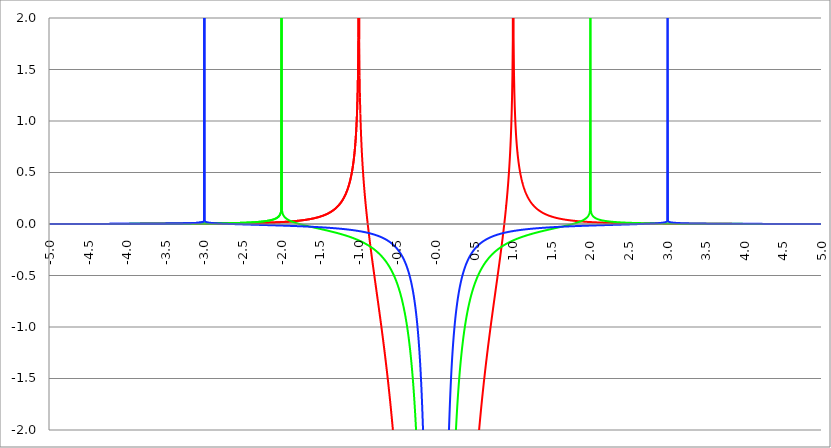
| Category | Series 1 | Series 0 | Series 2 |
|---|---|---|---|
| -5.0 | 0 | 0 | 0.001 |
| -4.995 | 0 | 0 | 0.001 |
| -4.99 | 0 | 0 | 0.001 |
| -4.985 | 0 | 0 | 0.001 |
| -4.98 | 0 | 0 | 0.001 |
| -4.975 | 0 | 0 | 0.001 |
| -4.97 | 0 | 0 | 0.001 |
| -4.965000000000001 | 0 | 0 | 0.001 |
| -4.960000000000001 | 0 | 0 | 0.001 |
| -4.955000000000001 | 0 | 0 | 0.001 |
| -4.950000000000001 | 0 | 0 | 0.001 |
| -4.945000000000001 | 0 | 0 | 0.001 |
| -4.940000000000001 | 0 | 0 | 0.001 |
| -4.935000000000001 | 0 | 0 | 0.001 |
| -4.930000000000001 | 0 | 0 | 0.001 |
| -4.925000000000002 | 0 | 0 | 0.001 |
| -4.920000000000002 | 0 | 0 | 0.001 |
| -4.915000000000002 | 0 | 0 | 0.001 |
| -4.910000000000002 | 0 | 0 | 0.001 |
| -4.905000000000002 | 0 | 0 | 0.001 |
| -4.900000000000002 | 0 | 0 | 0.001 |
| -4.895000000000002 | 0 | 0 | 0.001 |
| -4.890000000000002 | 0 | 0 | 0.001 |
| -4.885000000000002 | 0 | 0 | 0.001 |
| -4.880000000000002 | 0 | 0 | 0.001 |
| -4.875000000000003 | 0 | 0 | 0.001 |
| -4.870000000000003 | 0 | 0.001 | 0.001 |
| -4.865000000000003 | 0 | 0.001 | 0.001 |
| -4.860000000000003 | 0 | 0.001 | 0.001 |
| -4.855000000000003 | 0 | 0.001 | 0.001 |
| -4.850000000000003 | 0 | 0.001 | 0.001 |
| -4.845000000000003 | 0 | 0.001 | 0.001 |
| -4.840000000000003 | 0 | 0.001 | 0.001 |
| -4.835000000000003 | 0 | 0.001 | 0.001 |
| -4.830000000000004 | 0 | 0.001 | 0.001 |
| -4.825000000000004 | 0 | 0.001 | 0.001 |
| -4.820000000000004 | 0 | 0.001 | 0.001 |
| -4.815000000000004 | 0 | 0.001 | 0.001 |
| -4.810000000000004 | 0 | 0.001 | 0.001 |
| -4.805000000000004 | 0 | 0.001 | 0.001 |
| -4.800000000000004 | 0 | 0.001 | 0.001 |
| -4.795000000000004 | 0 | 0.001 | 0.001 |
| -4.790000000000004 | 0 | 0.001 | 0.001 |
| -4.785000000000004 | 0 | 0.001 | 0.001 |
| -4.780000000000004 | 0 | 0.001 | 0.001 |
| -4.775000000000004 | 0 | 0.001 | 0.001 |
| -4.770000000000004 | 0 | 0.001 | 0.001 |
| -4.765000000000005 | 0 | 0.001 | 0.001 |
| -4.760000000000005 | 0.001 | 0.001 | 0.001 |
| -4.755000000000005 | 0.001 | 0.001 | 0.001 |
| -4.750000000000005 | 0.001 | 0.001 | 0.001 |
| -4.745000000000005 | 0.001 | 0.001 | 0.001 |
| -4.740000000000005 | 0.001 | 0.001 | 0.001 |
| -4.735000000000005 | 0.001 | 0.001 | 0.001 |
| -4.730000000000005 | 0.001 | 0.001 | 0.001 |
| -4.725000000000006 | 0.001 | 0.001 | 0.001 |
| -4.720000000000006 | 0.001 | 0.001 | 0.001 |
| -4.715000000000006 | 0.001 | 0.001 | 0.001 |
| -4.710000000000006 | 0.001 | 0.001 | 0.001 |
| -4.705000000000006 | 0.001 | 0.001 | 0.001 |
| -4.700000000000006 | 0.001 | 0.001 | 0.001 |
| -4.695000000000006 | 0.001 | 0.001 | 0.001 |
| -4.690000000000006 | 0.001 | 0.001 | 0.001 |
| -4.685000000000007 | 0.001 | 0.001 | 0.001 |
| -4.680000000000007 | 0.001 | 0.001 | 0.001 |
| -4.675000000000007 | 0.001 | 0.001 | 0.001 |
| -4.670000000000007 | 0.001 | 0.001 | 0.001 |
| -4.665000000000007 | 0.001 | 0.001 | 0.001 |
| -4.660000000000007 | 0.001 | 0.001 | 0.001 |
| -4.655000000000007 | 0.001 | 0.001 | 0.001 |
| -4.650000000000007 | 0.001 | 0.001 | 0.001 |
| -4.645000000000007 | 0.001 | 0.001 | 0.001 |
| -4.640000000000008 | 0.001 | 0.001 | 0.001 |
| -4.635000000000008 | 0.001 | 0.001 | 0.001 |
| -4.630000000000008 | 0.001 | 0.001 | 0.001 |
| -4.625000000000008 | 0.001 | 0.001 | 0.001 |
| -4.620000000000008 | 0.001 | 0.001 | 0.001 |
| -4.615000000000008 | 0.001 | 0.001 | 0.001 |
| -4.610000000000008 | 0.001 | 0.001 | 0.001 |
| -4.605000000000008 | 0.001 | 0.001 | 0.001 |
| -4.600000000000008 | 0.001 | 0.001 | 0.001 |
| -4.595000000000009 | 0.001 | 0.001 | 0.001 |
| -4.590000000000009 | 0.001 | 0.001 | 0.001 |
| -4.585000000000009 | 0.001 | 0.001 | 0.001 |
| -4.580000000000009 | 0.001 | 0.001 | 0.001 |
| -4.57500000000001 | 0.001 | 0.001 | 0.001 |
| -4.57000000000001 | 0.001 | 0.001 | 0.001 |
| -4.565000000000009 | 0.001 | 0.001 | 0.001 |
| -4.560000000000009 | 0.001 | 0.001 | 0.001 |
| -4.555000000000009 | 0.001 | 0.001 | 0.001 |
| -4.55000000000001 | 0.001 | 0.001 | 0.001 |
| -4.54500000000001 | 0.001 | 0.001 | 0.001 |
| -4.54000000000001 | 0.001 | 0.001 | 0.001 |
| -4.53500000000001 | 0.001 | 0.001 | 0.001 |
| -4.53000000000001 | 0.001 | 0.001 | 0.001 |
| -4.52500000000001 | 0.001 | 0.001 | 0.001 |
| -4.52000000000001 | 0.001 | 0.001 | 0.001 |
| -4.51500000000001 | 0.001 | 0.001 | 0.001 |
| -4.51000000000001 | 0.001 | 0.001 | 0.001 |
| -4.505000000000011 | 0.001 | 0.001 | 0.001 |
| -4.500000000000011 | 0.001 | 0.001 | 0.001 |
| -4.495000000000011 | 0.001 | 0.001 | 0.001 |
| -4.490000000000011 | 0.001 | 0.001 | 0.001 |
| -4.485000000000011 | 0.001 | 0.001 | 0.001 |
| -4.480000000000011 | 0.001 | 0.001 | 0.001 |
| -4.475000000000011 | 0.001 | 0.001 | 0.001 |
| -4.470000000000011 | 0.001 | 0.001 | 0.001 |
| -4.465000000000011 | 0.001 | 0.001 | 0.001 |
| -4.460000000000011 | 0.001 | 0.001 | 0.001 |
| -4.455000000000012 | 0.001 | 0.001 | 0.001 |
| -4.450000000000012 | 0.001 | 0.001 | 0.001 |
| -4.445000000000012 | 0.001 | 0.001 | 0.001 |
| -4.440000000000012 | 0.001 | 0.001 | 0.001 |
| -4.435000000000012 | 0.001 | 0.001 | 0.001 |
| -4.430000000000012 | 0.001 | 0.001 | 0.001 |
| -4.425000000000012 | 0.001 | 0.001 | 0.001 |
| -4.420000000000012 | 0.001 | 0.001 | 0.001 |
| -4.415000000000012 | 0.001 | 0.001 | 0.001 |
| -4.410000000000013 | 0.001 | 0.001 | 0.001 |
| -4.405000000000013 | 0.001 | 0.001 | 0.001 |
| -4.400000000000013 | 0.001 | 0.001 | 0.001 |
| -4.395000000000013 | 0.001 | 0.001 | 0.001 |
| -4.390000000000013 | 0.001 | 0.001 | 0.001 |
| -4.385000000000013 | 0.001 | 0.001 | 0.001 |
| -4.380000000000013 | 0.001 | 0.001 | 0.001 |
| -4.375000000000013 | 0.001 | 0.001 | 0.001 |
| -4.370000000000013 | 0.001 | 0.001 | 0.001 |
| -4.365000000000013 | 0.001 | 0.001 | 0.001 |
| -4.360000000000014 | 0.001 | 0.001 | 0.001 |
| -4.355000000000014 | 0.001 | 0.001 | 0.001 |
| -4.350000000000014 | 0.001 | 0.001 | 0.001 |
| -4.345000000000014 | 0.001 | 0.001 | 0.001 |
| -4.340000000000014 | 0.001 | 0.001 | 0.001 |
| -4.335000000000014 | 0.001 | 0.001 | 0.001 |
| -4.330000000000014 | 0.001 | 0.001 | 0.001 |
| -4.325000000000014 | 0.001 | 0.001 | 0.001 |
| -4.320000000000014 | 0.001 | 0.001 | 0.001 |
| -4.315000000000015 | 0.001 | 0.001 | 0.001 |
| -4.310000000000015 | 0.001 | 0.001 | 0.001 |
| -4.305000000000015 | 0.001 | 0.001 | 0.001 |
| -4.300000000000015 | 0.001 | 0.001 | 0.001 |
| -4.295000000000015 | 0.001 | 0.001 | 0.001 |
| -4.290000000000015 | 0.001 | 0.001 | 0.001 |
| -4.285000000000015 | 0.001 | 0.001 | 0.001 |
| -4.280000000000015 | 0.001 | 0.001 | 0.001 |
| -4.275000000000015 | 0.001 | 0.001 | 0.001 |
| -4.270000000000015 | 0.001 | 0.001 | 0.001 |
| -4.265000000000016 | 0.001 | 0.001 | 0.001 |
| -4.260000000000016 | 0.001 | 0.001 | 0.001 |
| -4.255000000000016 | 0.001 | 0.001 | 0.001 |
| -4.250000000000016 | 0.001 | 0.001 | 0.001 |
| -4.245000000000016 | 0.001 | 0.001 | 0.001 |
| -4.240000000000016 | 0.001 | 0.001 | 0.001 |
| -4.235000000000016 | 0.001 | 0.001 | 0.001 |
| -4.230000000000016 | 0.001 | 0.001 | 0.001 |
| -4.225000000000017 | 0.001 | 0.001 | 0.001 |
| -4.220000000000017 | 0.001 | 0.001 | 0.001 |
| -4.215000000000017 | 0.001 | 0.001 | 0.001 |
| -4.210000000000017 | 0.001 | 0.001 | 0.001 |
| -4.205000000000017 | 0.001 | 0.001 | 0.001 |
| -4.200000000000017 | 0.001 | 0.001 | 0.001 |
| -4.195000000000017 | 0.001 | 0.001 | 0.001 |
| -4.190000000000017 | 0.001 | 0.001 | 0.001 |
| -4.185000000000017 | 0.001 | 0.001 | 0.001 |
| -4.180000000000017 | 0.001 | 0.001 | 0.001 |
| -4.175000000000018 | 0.001 | 0.001 | 0.001 |
| -4.170000000000018 | 0.001 | 0.001 | 0.001 |
| -4.165000000000018 | 0.001 | 0.001 | 0.001 |
| -4.160000000000018 | 0.001 | 0.001 | 0.001 |
| -4.155000000000018 | 0.001 | 0.001 | 0.001 |
| -4.150000000000018 | 0.001 | 0.001 | 0.001 |
| -4.145000000000018 | 0.001 | 0.001 | 0.001 |
| -4.140000000000018 | 0.001 | 0.001 | 0.001 |
| -4.135000000000018 | 0.001 | 0.001 | 0.001 |
| -4.130000000000019 | 0.001 | 0.001 | 0.001 |
| -4.125000000000019 | 0.001 | 0.001 | 0.001 |
| -4.120000000000019 | 0.001 | 0.001 | 0.001 |
| -4.115000000000019 | 0.001 | 0.001 | 0.001 |
| -4.110000000000019 | 0.001 | 0.001 | 0.001 |
| -4.105000000000019 | 0.001 | 0.001 | 0.001 |
| -4.100000000000019 | 0.001 | 0.001 | 0.001 |
| -4.095000000000019 | 0.001 | 0.001 | 0.001 |
| -4.090000000000019 | 0.001 | 0.001 | 0.001 |
| -4.085000000000019 | 0.001 | 0.001 | 0.001 |
| -4.08000000000002 | 0.001 | 0.001 | 0.001 |
| -4.07500000000002 | 0.001 | 0.001 | 0.001 |
| -4.07000000000002 | 0.001 | 0.001 | 0.001 |
| -4.06500000000002 | 0.001 | 0.001 | 0.001 |
| -4.06000000000002 | 0.001 | 0.001 | 0.002 |
| -4.05500000000002 | 0.001 | 0.001 | 0.002 |
| -4.05000000000002 | 0.001 | 0.001 | 0.002 |
| -4.04500000000002 | 0.001 | 0.001 | 0.002 |
| -4.04000000000002 | 0.001 | 0.001 | 0.002 |
| -4.03500000000002 | 0.001 | 0.001 | 0.002 |
| -4.03000000000002 | 0.001 | 0.001 | 0.002 |
| -4.025000000000021 | 0.001 | 0.001 | 0.002 |
| -4.020000000000021 | 0.001 | 0.001 | 0.002 |
| -4.015000000000021 | 0.001 | 0.001 | 0.002 |
| -4.010000000000021 | 0.001 | 0.001 | 0.002 |
| -4.005000000000021 | 0.001 | 0.001 | 0.002 |
| -4.000000000000021 | 0.001 | 0.001 | 0.002 |
| -3.995000000000021 | 0.001 | 0.001 | 0.002 |
| -3.990000000000021 | 0.001 | 0.001 | 0.002 |
| -3.985000000000022 | 0.001 | 0.001 | 0.002 |
| -3.980000000000022 | 0.001 | 0.001 | 0.002 |
| -3.975000000000022 | 0.001 | 0.001 | 0.002 |
| -3.970000000000022 | 0.001 | 0.001 | 0.002 |
| -3.965000000000022 | 0.001 | 0.001 | 0.002 |
| -3.960000000000022 | 0.001 | 0.001 | 0.002 |
| -3.955000000000022 | 0.001 | 0.001 | 0.002 |
| -3.950000000000022 | 0.001 | 0.001 | 0.002 |
| -3.945000000000022 | 0.001 | 0.001 | 0.002 |
| -3.940000000000023 | 0.001 | 0.001 | 0.002 |
| -3.935000000000023 | 0.001 | 0.001 | 0.002 |
| -3.930000000000023 | 0.001 | 0.001 | 0.002 |
| -3.925000000000023 | 0.001 | 0.001 | 0.002 |
| -3.920000000000023 | 0.001 | 0.001 | 0.002 |
| -3.915000000000023 | 0.001 | 0.001 | 0.002 |
| -3.910000000000023 | 0.001 | 0.001 | 0.002 |
| -3.905000000000023 | 0.001 | 0.001 | 0.002 |
| -3.900000000000023 | 0.001 | 0.001 | 0.002 |
| -3.895000000000023 | 0.001 | 0.001 | 0.002 |
| -3.890000000000024 | 0.001 | 0.001 | 0.002 |
| -3.885000000000024 | 0.001 | 0.001 | 0.002 |
| -3.880000000000024 | 0.001 | 0.001 | 0.002 |
| -3.875000000000024 | 0.001 | 0.001 | 0.002 |
| -3.870000000000024 | 0.001 | 0.001 | 0.002 |
| -3.865000000000024 | 0.001 | 0.001 | 0.002 |
| -3.860000000000024 | 0.001 | 0.001 | 0.002 |
| -3.855000000000024 | 0.001 | 0.001 | 0.002 |
| -3.850000000000024 | 0.001 | 0.001 | 0.002 |
| -3.845000000000025 | 0.001 | 0.001 | 0.002 |
| -3.840000000000025 | 0.001 | 0.001 | 0.002 |
| -3.835000000000025 | 0.001 | 0.001 | 0.002 |
| -3.830000000000025 | 0.001 | 0.001 | 0.002 |
| -3.825000000000025 | 0.001 | 0.001 | 0.002 |
| -3.820000000000025 | 0.001 | 0.001 | 0.002 |
| -3.815000000000025 | 0.001 | 0.001 | 0.002 |
| -3.810000000000025 | 0.001 | 0.001 | 0.002 |
| -3.805000000000025 | 0.001 | 0.001 | 0.002 |
| -3.800000000000026 | 0.001 | 0.001 | 0.002 |
| -3.795000000000026 | 0.001 | 0.001 | 0.002 |
| -3.790000000000026 | 0.001 | 0.001 | 0.002 |
| -3.785000000000026 | 0.001 | 0.002 | 0.002 |
| -3.780000000000026 | 0.001 | 0.002 | 0.002 |
| -3.775000000000026 | 0.001 | 0.002 | 0.002 |
| -3.770000000000026 | 0.001 | 0.002 | 0.002 |
| -3.765000000000026 | 0.001 | 0.002 | 0.002 |
| -3.760000000000026 | 0.001 | 0.002 | 0.002 |
| -3.755000000000026 | 0.001 | 0.002 | 0.002 |
| -3.750000000000027 | 0.001 | 0.002 | 0.002 |
| -3.745000000000027 | 0.001 | 0.002 | 0.002 |
| -3.740000000000027 | 0.001 | 0.002 | 0.002 |
| -3.735000000000027 | 0.001 | 0.002 | 0.002 |
| -3.730000000000027 | 0.001 | 0.002 | 0.002 |
| -3.725000000000027 | 0.001 | 0.002 | 0.002 |
| -3.720000000000027 | 0.001 | 0.002 | 0.002 |
| -3.715000000000027 | 0.001 | 0.002 | 0.002 |
| -3.710000000000027 | 0.001 | 0.002 | 0.003 |
| -3.705000000000028 | 0.001 | 0.002 | 0.003 |
| -3.700000000000028 | 0.001 | 0.002 | 0.003 |
| -3.695000000000028 | 0.001 | 0.002 | 0.003 |
| -3.690000000000028 | 0.001 | 0.002 | 0.003 |
| -3.685000000000028 | 0.001 | 0.002 | 0.003 |
| -3.680000000000028 | 0.001 | 0.002 | 0.003 |
| -3.675000000000028 | 0.001 | 0.002 | 0.003 |
| -3.670000000000028 | 0.001 | 0.002 | 0.003 |
| -3.665000000000028 | 0.001 | 0.002 | 0.003 |
| -3.660000000000028 | 0.001 | 0.002 | 0.003 |
| -3.655000000000029 | 0.001 | 0.002 | 0.003 |
| -3.650000000000029 | 0.001 | 0.002 | 0.003 |
| -3.645000000000029 | 0.001 | 0.002 | 0.003 |
| -3.640000000000029 | 0.002 | 0.002 | 0.003 |
| -3.635000000000029 | 0.002 | 0.002 | 0.003 |
| -3.630000000000029 | 0.002 | 0.002 | 0.003 |
| -3.625000000000029 | 0.002 | 0.002 | 0.003 |
| -3.620000000000029 | 0.002 | 0.002 | 0.003 |
| -3.615000000000029 | 0.002 | 0.002 | 0.003 |
| -3.61000000000003 | 0.002 | 0.002 | 0.003 |
| -3.60500000000003 | 0.002 | 0.002 | 0.003 |
| -3.60000000000003 | 0.002 | 0.002 | 0.003 |
| -3.59500000000003 | 0.002 | 0.002 | 0.003 |
| -3.59000000000003 | 0.002 | 0.002 | 0.003 |
| -3.58500000000003 | 0.002 | 0.002 | 0.003 |
| -3.58000000000003 | 0.002 | 0.002 | 0.003 |
| -3.57500000000003 | 0.002 | 0.002 | 0.003 |
| -3.57000000000003 | 0.002 | 0.002 | 0.003 |
| -3.565000000000031 | 0.002 | 0.002 | 0.003 |
| -3.560000000000031 | 0.002 | 0.002 | 0.003 |
| -3.555000000000031 | 0.002 | 0.002 | 0.003 |
| -3.550000000000031 | 0.002 | 0.002 | 0.003 |
| -3.545000000000031 | 0.002 | 0.002 | 0.003 |
| -3.540000000000031 | 0.002 | 0.002 | 0.003 |
| -3.535000000000031 | 0.002 | 0.002 | 0.003 |
| -3.530000000000031 | 0.002 | 0.002 | 0.003 |
| -3.525000000000031 | 0.002 | 0.002 | 0.003 |
| -3.520000000000032 | 0.002 | 0.002 | 0.004 |
| -3.515000000000032 | 0.002 | 0.002 | 0.004 |
| -3.510000000000032 | 0.002 | 0.002 | 0.004 |
| -3.505000000000032 | 0.002 | 0.002 | 0.004 |
| -3.500000000000032 | 0.002 | 0.002 | 0.004 |
| -3.495000000000032 | 0.002 | 0.002 | 0.004 |
| -3.490000000000032 | 0.002 | 0.002 | 0.004 |
| -3.485000000000032 | 0.002 | 0.002 | 0.004 |
| -3.480000000000032 | 0.002 | 0.002 | 0.004 |
| -3.475000000000032 | 0.002 | 0.002 | 0.004 |
| -3.470000000000033 | 0.002 | 0.002 | 0.004 |
| -3.465000000000033 | 0.002 | 0.002 | 0.004 |
| -3.460000000000033 | 0.002 | 0.002 | 0.004 |
| -3.455000000000033 | 0.002 | 0.002 | 0.004 |
| -3.450000000000033 | 0.002 | 0.002 | 0.004 |
| -3.445000000000033 | 0.002 | 0.002 | 0.004 |
| -3.440000000000033 | 0.002 | 0.002 | 0.004 |
| -3.435000000000033 | 0.002 | 0.002 | 0.004 |
| -3.430000000000033 | 0.002 | 0.002 | 0.004 |
| -3.425000000000034 | 0.002 | 0.002 | 0.004 |
| -3.420000000000034 | 0.002 | 0.002 | 0.004 |
| -3.415000000000034 | 0.002 | 0.002 | 0.004 |
| -3.410000000000034 | 0.002 | 0.002 | 0.004 |
| -3.405000000000034 | 0.002 | 0.002 | 0.004 |
| -3.400000000000034 | 0.002 | 0.002 | 0.004 |
| -3.395000000000034 | 0.002 | 0.002 | 0.005 |
| -3.390000000000034 | 0.002 | 0.002 | 0.005 |
| -3.385000000000034 | 0.002 | 0.003 | 0.005 |
| -3.380000000000034 | 0.002 | 0.003 | 0.005 |
| -3.375000000000035 | 0.002 | 0.003 | 0.005 |
| -3.370000000000035 | 0.002 | 0.003 | 0.005 |
| -3.365000000000035 | 0.002 | 0.003 | 0.005 |
| -3.360000000000035 | 0.002 | 0.003 | 0.005 |
| -3.355000000000035 | 0.002 | 0.003 | 0.005 |
| -3.350000000000035 | 0.002 | 0.003 | 0.005 |
| -3.345000000000035 | 0.002 | 0.003 | 0.005 |
| -3.340000000000035 | 0.002 | 0.003 | 0.005 |
| -3.335000000000035 | 0.002 | 0.003 | 0.005 |
| -3.330000000000036 | 0.002 | 0.003 | 0.005 |
| -3.325000000000036 | 0.002 | 0.003 | 0.005 |
| -3.320000000000036 | 0.002 | 0.003 | 0.005 |
| -3.315000000000036 | 0.002 | 0.003 | 0.005 |
| -3.310000000000036 | 0.002 | 0.003 | 0.006 |
| -3.305000000000036 | 0.002 | 0.003 | 0.006 |
| -3.300000000000036 | 0.002 | 0.003 | 0.006 |
| -3.295000000000036 | 0.002 | 0.003 | 0.006 |
| -3.290000000000036 | 0.002 | 0.003 | 0.006 |
| -3.285000000000036 | 0.002 | 0.003 | 0.006 |
| -3.280000000000036 | 0.002 | 0.003 | 0.006 |
| -3.275000000000037 | 0.002 | 0.003 | 0.006 |
| -3.270000000000037 | 0.002 | 0.003 | 0.006 |
| -3.265000000000037 | 0.002 | 0.003 | 0.006 |
| -3.260000000000037 | 0.002 | 0.003 | 0.006 |
| -3.255000000000037 | 0.002 | 0.003 | 0.006 |
| -3.250000000000037 | 0.002 | 0.003 | 0.007 |
| -3.245000000000037 | 0.002 | 0.003 | 0.007 |
| -3.240000000000037 | 0.002 | 0.003 | 0.007 |
| -3.235000000000038 | 0.002 | 0.003 | 0.007 |
| -3.230000000000038 | 0.002 | 0.003 | 0.007 |
| -3.225000000000038 | 0.002 | 0.003 | 0.007 |
| -3.220000000000038 | 0.002 | 0.003 | 0.007 |
| -3.215000000000038 | 0.003 | 0.003 | 0.007 |
| -3.210000000000038 | 0.003 | 0.003 | 0.007 |
| -3.205000000000038 | 0.003 | 0.003 | 0.007 |
| -3.200000000000038 | 0.003 | 0.003 | 0.008 |
| -3.195000000000038 | 0.003 | 0.003 | 0.008 |
| -3.190000000000039 | 0.003 | 0.003 | 0.008 |
| -3.185000000000039 | 0.003 | 0.003 | 0.008 |
| -3.180000000000039 | 0.003 | 0.003 | 0.008 |
| -3.175000000000039 | 0.003 | 0.003 | 0.008 |
| -3.170000000000039 | 0.003 | 0.003 | 0.008 |
| -3.16500000000004 | 0.003 | 0.003 | 0.009 |
| -3.16000000000004 | 0.003 | 0.003 | 0.009 |
| -3.155000000000039 | 0.003 | 0.004 | 0.009 |
| -3.150000000000039 | 0.003 | 0.004 | 0.009 |
| -3.14500000000004 | 0.003 | 0.004 | 0.009 |
| -3.14000000000004 | 0.003 | 0.004 | 0.009 |
| -3.13500000000004 | 0.003 | 0.004 | 0.01 |
| -3.13000000000004 | 0.003 | 0.004 | 0.01 |
| -3.12500000000004 | 0.003 | 0.004 | 0.01 |
| -3.12000000000004 | 0.003 | 0.004 | 0.01 |
| -3.11500000000004 | 0.003 | 0.004 | 0.01 |
| -3.11000000000004 | 0.003 | 0.004 | 0.011 |
| -3.10500000000004 | 0.003 | 0.004 | 0.011 |
| -3.10000000000004 | 0.003 | 0.004 | 0.011 |
| -3.095000000000041 | 0.003 | 0.004 | 0.012 |
| -3.090000000000041 | 0.003 | 0.004 | 0.012 |
| -3.085000000000041 | 0.003 | 0.004 | 0.012 |
| -3.080000000000041 | 0.003 | 0.004 | 0.012 |
| -3.075000000000041 | 0.003 | 0.004 | 0.013 |
| -3.070000000000041 | 0.003 | 0.004 | 0.013 |
| -3.065000000000041 | 0.003 | 0.004 | 0.014 |
| -3.060000000000041 | 0.003 | 0.004 | 0.014 |
| -3.055000000000041 | 0.003 | 0.004 | 0.015 |
| -3.050000000000042 | 0.003 | 0.004 | 0.015 |
| -3.045000000000042 | 0.003 | 0.004 | 0.016 |
| -3.040000000000042 | 0.003 | 0.004 | 0.016 |
| -3.035000000000042 | 0.003 | 0.004 | 0.017 |
| -3.030000000000042 | 0.003 | 0.004 | 0.018 |
| -3.025000000000042 | 0.003 | 0.004 | 0.019 |
| -3.020000000000042 | 0.003 | 0.004 | 0.021 |
| -3.015000000000042 | 0.003 | 0.004 | 0.022 |
| -3.010000000000042 | 0.003 | 0.004 | 0.025 |
| -3.005000000000043 | 0.003 | 0.004 | 0.029 |
| -3.000000000000043 | 0.003 | 0.004 | 5 |
| -2.995000000000043 | 0.003 | 0.005 | 0.029 |
| -2.990000000000043 | 0.003 | 0.005 | 0.025 |
| -2.985000000000043 | 0.003 | 0.005 | 0.022 |
| -2.980000000000043 | 0.003 | 0.005 | 0.02 |
| -2.975000000000043 | 0.003 | 0.005 | 0.019 |
| -2.970000000000043 | 0.003 | 0.005 | 0.018 |
| -2.965000000000043 | 0.004 | 0.005 | 0.017 |
| -2.960000000000043 | 0.004 | 0.005 | 0.016 |
| -2.955000000000044 | 0.004 | 0.005 | 0.015 |
| -2.950000000000044 | 0.004 | 0.005 | 0.014 |
| -2.945000000000044 | 0.004 | 0.005 | 0.014 |
| -2.940000000000044 | 0.004 | 0.005 | 0.013 |
| -2.935000000000044 | 0.004 | 0.005 | 0.013 |
| -2.930000000000044 | 0.004 | 0.005 | 0.012 |
| -2.925000000000044 | 0.004 | 0.005 | 0.012 |
| -2.920000000000044 | 0.004 | 0.005 | 0.011 |
| -2.915000000000044 | 0.004 | 0.005 | 0.011 |
| -2.910000000000045 | 0.004 | 0.005 | 0.011 |
| -2.905000000000045 | 0.004 | 0.005 | 0.01 |
| -2.900000000000045 | 0.004 | 0.005 | 0.01 |
| -2.895000000000045 | 0.004 | 0.005 | 0.009 |
| -2.890000000000045 | 0.004 | 0.005 | 0.009 |
| -2.885000000000045 | 0.004 | 0.005 | 0.009 |
| -2.880000000000045 | 0.004 | 0.006 | 0.009 |
| -2.875000000000045 | 0.004 | 0.006 | 0.008 |
| -2.870000000000045 | 0.004 | 0.006 | 0.008 |
| -2.865000000000045 | 0.004 | 0.006 | 0.008 |
| -2.860000000000046 | 0.004 | 0.006 | 0.007 |
| -2.855000000000046 | 0.004 | 0.006 | 0.007 |
| -2.850000000000046 | 0.004 | 0.006 | 0.007 |
| -2.845000000000046 | 0.004 | 0.006 | 0.007 |
| -2.840000000000046 | 0.004 | 0.006 | 0.006 |
| -2.835000000000046 | 0.004 | 0.006 | 0.006 |
| -2.830000000000046 | 0.004 | 0.006 | 0.006 |
| -2.825000000000046 | 0.004 | 0.006 | 0.006 |
| -2.820000000000046 | 0.004 | 0.006 | 0.006 |
| -2.815000000000047 | 0.004 | 0.006 | 0.005 |
| -2.810000000000047 | 0.004 | 0.006 | 0.005 |
| -2.805000000000047 | 0.004 | 0.006 | 0.005 |
| -2.800000000000047 | 0.004 | 0.006 | 0.005 |
| -2.795000000000047 | 0.004 | 0.006 | 0.005 |
| -2.790000000000047 | 0.005 | 0.006 | 0.004 |
| -2.785000000000047 | 0.005 | 0.007 | 0.004 |
| -2.780000000000047 | 0.005 | 0.007 | 0.004 |
| -2.775000000000047 | 0.005 | 0.007 | 0.004 |
| -2.770000000000047 | 0.005 | 0.007 | 0.004 |
| -2.765000000000048 | 0.005 | 0.007 | 0.003 |
| -2.760000000000048 | 0.005 | 0.007 | 0.003 |
| -2.755000000000048 | 0.005 | 0.007 | 0.003 |
| -2.750000000000048 | 0.005 | 0.007 | 0.003 |
| -2.745000000000048 | 0.005 | 0.007 | 0.003 |
| -2.740000000000048 | 0.005 | 0.007 | 0.003 |
| -2.735000000000048 | 0.005 | 0.007 | 0.002 |
| -2.730000000000048 | 0.005 | 0.007 | 0.002 |
| -2.725000000000048 | 0.005 | 0.007 | 0.002 |
| -2.720000000000049 | 0.005 | 0.007 | 0.002 |
| -2.715000000000049 | 0.005 | 0.007 | 0.002 |
| -2.710000000000049 | 0.005 | 0.008 | 0.002 |
| -2.705000000000049 | 0.005 | 0.008 | 0.001 |
| -2.700000000000049 | 0.005 | 0.008 | 0.001 |
| -2.695000000000049 | 0.005 | 0.008 | 0.001 |
| -2.690000000000049 | 0.005 | 0.008 | 0.001 |
| -2.685000000000049 | 0.005 | 0.008 | 0.001 |
| -2.680000000000049 | 0.005 | 0.008 | 0.001 |
| -2.675000000000049 | 0.005 | 0.008 | 0.001 |
| -2.67000000000005 | 0.005 | 0.008 | 0 |
| -2.66500000000005 | 0.005 | 0.008 | 0 |
| -2.66000000000005 | 0.006 | 0.008 | 0 |
| -2.65500000000005 | 0.006 | 0.008 | 0 |
| -2.65000000000005 | 0.006 | 0.009 | 0 |
| -2.64500000000005 | 0.006 | 0.009 | 0 |
| -2.64000000000005 | 0.006 | 0.009 | 0 |
| -2.63500000000005 | 0.006 | 0.009 | 0 |
| -2.63000000000005 | 0.006 | 0.009 | -0.001 |
| -2.625000000000051 | 0.006 | 0.009 | -0.001 |
| -2.620000000000051 | 0.006 | 0.009 | -0.001 |
| -2.615000000000051 | 0.006 | 0.009 | -0.001 |
| -2.610000000000051 | 0.006 | 0.009 | -0.001 |
| -2.605000000000051 | 0.006 | 0.009 | -0.001 |
| -2.600000000000051 | 0.006 | 0.01 | -0.001 |
| -2.595000000000051 | 0.006 | 0.01 | -0.002 |
| -2.590000000000051 | 0.006 | 0.01 | -0.002 |
| -2.585000000000051 | 0.006 | 0.01 | -0.002 |
| -2.580000000000052 | 0.006 | 0.01 | -0.002 |
| -2.575000000000052 | 0.006 | 0.01 | -0.002 |
| -2.570000000000052 | 0.006 | 0.01 | -0.002 |
| -2.565000000000052 | 0.006 | 0.01 | -0.002 |
| -2.560000000000052 | 0.006 | 0.01 | -0.002 |
| -2.555000000000052 | 0.007 | 0.01 | -0.003 |
| -2.550000000000052 | 0.007 | 0.011 | -0.003 |
| -2.545000000000052 | 0.007 | 0.011 | -0.003 |
| -2.540000000000052 | 0.007 | 0.011 | -0.003 |
| -2.535000000000053 | 0.007 | 0.011 | -0.003 |
| -2.530000000000053 | 0.007 | 0.011 | -0.003 |
| -2.525000000000053 | 0.007 | 0.011 | -0.003 |
| -2.520000000000053 | 0.007 | 0.011 | -0.003 |
| -2.515000000000053 | 0.007 | 0.012 | -0.003 |
| -2.510000000000053 | 0.007 | 0.012 | -0.004 |
| -2.505000000000053 | 0.007 | 0.012 | -0.004 |
| -2.500000000000053 | 0.007 | 0.012 | -0.004 |
| -2.495000000000053 | 0.007 | 0.012 | -0.004 |
| -2.490000000000053 | 0.007 | 0.012 | -0.004 |
| -2.485000000000054 | 0.007 | 0.012 | -0.004 |
| -2.480000000000054 | 0.007 | 0.013 | -0.004 |
| -2.475000000000054 | 0.007 | 0.013 | -0.004 |
| -2.470000000000054 | 0.008 | 0.013 | -0.005 |
| -2.465000000000054 | 0.008 | 0.013 | -0.005 |
| -2.460000000000054 | 0.008 | 0.013 | -0.005 |
| -2.455000000000054 | 0.008 | 0.013 | -0.005 |
| -2.450000000000054 | 0.008 | 0.013 | -0.005 |
| -2.445000000000054 | 0.008 | 0.014 | -0.005 |
| -2.440000000000055 | 0.008 | 0.014 | -0.005 |
| -2.435000000000055 | 0.008 | 0.014 | -0.005 |
| -2.430000000000055 | 0.008 | 0.014 | -0.005 |
| -2.425000000000055 | 0.008 | 0.014 | -0.006 |
| -2.420000000000055 | 0.008 | 0.015 | -0.006 |
| -2.415000000000055 | 0.008 | 0.015 | -0.006 |
| -2.410000000000055 | 0.008 | 0.015 | -0.006 |
| -2.405000000000055 | 0.008 | 0.015 | -0.006 |
| -2.400000000000055 | 0.009 | 0.015 | -0.006 |
| -2.395000000000055 | 0.009 | 0.016 | -0.006 |
| -2.390000000000056 | 0.009 | 0.016 | -0.006 |
| -2.385000000000056 | 0.009 | 0.016 | -0.006 |
| -2.380000000000056 | 0.009 | 0.016 | -0.007 |
| -2.375000000000056 | 0.009 | 0.016 | -0.007 |
| -2.370000000000056 | 0.009 | 0.017 | -0.007 |
| -2.365000000000056 | 0.009 | 0.017 | -0.007 |
| -2.360000000000056 | 0.009 | 0.017 | -0.007 |
| -2.355000000000056 | 0.009 | 0.017 | -0.007 |
| -2.350000000000056 | 0.009 | 0.018 | -0.007 |
| -2.345000000000057 | 0.009 | 0.018 | -0.007 |
| -2.340000000000057 | 0.01 | 0.018 | -0.007 |
| -2.335000000000057 | 0.01 | 0.018 | -0.008 |
| -2.330000000000057 | 0.01 | 0.019 | -0.008 |
| -2.325000000000057 | 0.01 | 0.019 | -0.008 |
| -2.320000000000057 | 0.01 | 0.019 | -0.008 |
| -2.315000000000057 | 0.01 | 0.02 | -0.008 |
| -2.310000000000057 | 0.01 | 0.02 | -0.008 |
| -2.305000000000057 | 0.01 | 0.02 | -0.008 |
| -2.300000000000058 | 0.01 | 0.02 | -0.008 |
| -2.295000000000058 | 0.01 | 0.021 | -0.008 |
| -2.290000000000058 | 0.01 | 0.021 | -0.009 |
| -2.285000000000058 | 0.011 | 0.021 | -0.009 |
| -2.280000000000058 | 0.011 | 0.022 | -0.009 |
| -2.275000000000058 | 0.011 | 0.022 | -0.009 |
| -2.270000000000058 | 0.011 | 0.023 | -0.009 |
| -2.265000000000058 | 0.011 | 0.023 | -0.009 |
| -2.260000000000058 | 0.011 | 0.023 | -0.009 |
| -2.255000000000058 | 0.011 | 0.024 | -0.009 |
| -2.250000000000059 | 0.011 | 0.024 | -0.009 |
| -2.245000000000059 | 0.011 | 0.025 | -0.01 |
| -2.240000000000059 | 0.011 | 0.025 | -0.01 |
| -2.235000000000059 | 0.012 | 0.025 | -0.01 |
| -2.23000000000006 | 0.012 | 0.026 | -0.01 |
| -2.22500000000006 | 0.012 | 0.026 | -0.01 |
| -2.22000000000006 | 0.012 | 0.027 | -0.01 |
| -2.215000000000059 | 0.012 | 0.027 | -0.01 |
| -2.210000000000059 | 0.012 | 0.028 | -0.01 |
| -2.20500000000006 | 0.012 | 0.028 | -0.01 |
| -2.20000000000006 | 0.012 | 0.029 | -0.011 |
| -2.19500000000006 | 0.013 | 0.029 | -0.011 |
| -2.19000000000006 | 0.013 | 0.03 | -0.011 |
| -2.18500000000006 | 0.013 | 0.031 | -0.011 |
| -2.18000000000006 | 0.013 | 0.031 | -0.011 |
| -2.17500000000006 | 0.013 | 0.032 | -0.011 |
| -2.17000000000006 | 0.013 | 0.033 | -0.011 |
| -2.16500000000006 | 0.013 | 0.033 | -0.011 |
| -2.160000000000061 | 0.013 | 0.034 | -0.011 |
| -2.155000000000061 | 0.014 | 0.035 | -0.012 |
| -2.150000000000061 | 0.014 | 0.036 | -0.012 |
| -2.145000000000061 | 0.014 | 0.036 | -0.012 |
| -2.140000000000061 | 0.014 | 0.037 | -0.012 |
| -2.135000000000061 | 0.014 | 0.038 | -0.012 |
| -2.130000000000061 | 0.014 | 0.039 | -0.012 |
| -2.125000000000061 | 0.014 | 0.04 | -0.012 |
| -2.120000000000061 | 0.015 | 0.041 | -0.012 |
| -2.115000000000061 | 0.015 | 0.042 | -0.012 |
| -2.110000000000062 | 0.015 | 0.043 | -0.013 |
| -2.105000000000062 | 0.015 | 0.045 | -0.013 |
| -2.100000000000062 | 0.015 | 0.046 | -0.013 |
| -2.095000000000062 | 0.015 | 0.047 | -0.013 |
| -2.090000000000062 | 0.016 | 0.049 | -0.013 |
| -2.085000000000062 | 0.016 | 0.05 | -0.013 |
| -2.080000000000062 | 0.016 | 0.052 | -0.013 |
| -2.075000000000062 | 0.016 | 0.054 | -0.013 |
| -2.070000000000062 | 0.016 | 0.056 | -0.014 |
| -2.065000000000063 | 0.016 | 0.058 | -0.014 |
| -2.060000000000063 | 0.017 | 0.06 | -0.014 |
| -2.055000000000063 | 0.017 | 0.062 | -0.014 |
| -2.050000000000063 | 0.017 | 0.065 | -0.014 |
| -2.045000000000063 | 0.017 | 0.068 | -0.014 |
| -2.040000000000063 | 0.017 | 0.071 | -0.014 |
| -2.035000000000063 | 0.017 | 0.075 | -0.014 |
| -2.030000000000063 | 0.018 | 0.08 | -0.015 |
| -2.025000000000063 | 0.018 | 0.085 | -0.015 |
| -2.020000000000064 | 0.018 | 0.092 | -0.015 |
| -2.015000000000064 | 0.018 | 0.101 | -0.015 |
| -2.010000000000064 | 0.018 | 0.113 | -0.015 |
| -2.005000000000064 | 0.019 | 0.135 | -0.015 |
| -2.000000000000064 | 0.019 | 5 | -0.015 |
| -1.995000000000064 | 0.019 | 0.134 | -0.015 |
| -1.990000000000064 | 0.019 | 0.112 | -0.016 |
| -1.985000000000064 | 0.019 | 0.099 | -0.016 |
| -1.980000000000064 | 0.02 | 0.09 | -0.016 |
| -1.975000000000064 | 0.02 | 0.083 | -0.016 |
| -1.970000000000065 | 0.02 | 0.077 | -0.016 |
| -1.965000000000065 | 0.02 | 0.072 | -0.016 |
| -1.960000000000065 | 0.021 | 0.067 | -0.016 |
| -1.955000000000065 | 0.021 | 0.063 | -0.016 |
| -1.950000000000065 | 0.021 | 0.06 | -0.017 |
| -1.945000000000065 | 0.021 | 0.056 | -0.017 |
| -1.940000000000065 | 0.022 | 0.053 | -0.017 |
| -1.935000000000065 | 0.022 | 0.05 | -0.017 |
| -1.930000000000065 | 0.022 | 0.048 | -0.017 |
| -1.925000000000066 | 0.022 | 0.045 | -0.017 |
| -1.920000000000066 | 0.023 | 0.043 | -0.017 |
| -1.915000000000066 | 0.023 | 0.041 | -0.017 |
| -1.910000000000066 | 0.023 | 0.039 | -0.018 |
| -1.905000000000066 | 0.023 | 0.037 | -0.018 |
| -1.900000000000066 | 0.024 | 0.035 | -0.018 |
| -1.895000000000066 | 0.024 | 0.033 | -0.018 |
| -1.890000000000066 | 0.024 | 0.031 | -0.018 |
| -1.885000000000066 | 0.025 | 0.03 | -0.018 |
| -1.880000000000066 | 0.025 | 0.028 | -0.018 |
| -1.875000000000067 | 0.025 | 0.026 | -0.019 |
| -1.870000000000067 | 0.025 | 0.025 | -0.019 |
| -1.865000000000067 | 0.026 | 0.023 | -0.019 |
| -1.860000000000067 | 0.026 | 0.022 | -0.019 |
| -1.855000000000067 | 0.026 | 0.02 | -0.019 |
| -1.850000000000067 | 0.027 | 0.019 | -0.019 |
| -1.845000000000067 | 0.027 | 0.018 | -0.019 |
| -1.840000000000067 | 0.027 | 0.016 | -0.02 |
| -1.835000000000067 | 0.028 | 0.015 | -0.02 |
| -1.830000000000068 | 0.028 | 0.014 | -0.02 |
| -1.825000000000068 | 0.028 | 0.013 | -0.02 |
| -1.820000000000068 | 0.029 | 0.011 | -0.02 |
| -1.815000000000068 | 0.029 | 0.01 | -0.02 |
| -1.810000000000068 | 0.029 | 0.009 | -0.02 |
| -1.805000000000068 | 0.03 | 0.008 | -0.021 |
| -1.800000000000068 | 0.03 | 0.007 | -0.021 |
| -1.795000000000068 | 0.031 | 0.006 | -0.021 |
| -1.790000000000068 | 0.031 | 0.005 | -0.021 |
| -1.785000000000068 | 0.031 | 0.003 | -0.021 |
| -1.780000000000069 | 0.032 | 0.002 | -0.021 |
| -1.775000000000069 | 0.032 | 0.001 | -0.021 |
| -1.770000000000069 | 0.033 | 0 | -0.022 |
| -1.765000000000069 | 0.033 | -0.001 | -0.022 |
| -1.760000000000069 | 0.034 | -0.002 | -0.022 |
| -1.75500000000007 | 0.034 | -0.003 | -0.022 |
| -1.75000000000007 | 0.034 | -0.004 | -0.022 |
| -1.745000000000069 | 0.035 | -0.005 | -0.022 |
| -1.740000000000069 | 0.035 | -0.006 | -0.023 |
| -1.73500000000007 | 0.036 | -0.007 | -0.023 |
| -1.73000000000007 | 0.036 | -0.008 | -0.023 |
| -1.72500000000007 | 0.037 | -0.009 | -0.023 |
| -1.72000000000007 | 0.037 | -0.01 | -0.023 |
| -1.71500000000007 | 0.038 | -0.011 | -0.023 |
| -1.71000000000007 | 0.038 | -0.012 | -0.024 |
| -1.70500000000007 | 0.039 | -0.012 | -0.024 |
| -1.70000000000007 | 0.039 | -0.013 | -0.024 |
| -1.69500000000007 | 0.04 | -0.014 | -0.024 |
| -1.69000000000007 | 0.04 | -0.015 | -0.024 |
| -1.685000000000071 | 0.041 | -0.016 | -0.024 |
| -1.680000000000071 | 0.042 | -0.017 | -0.025 |
| -1.675000000000071 | 0.042 | -0.018 | -0.025 |
| -1.670000000000071 | 0.043 | -0.019 | -0.025 |
| -1.665000000000071 | 0.043 | -0.02 | -0.025 |
| -1.660000000000071 | 0.044 | -0.021 | -0.025 |
| -1.655000000000071 | 0.045 | -0.021 | -0.025 |
| -1.650000000000071 | 0.045 | -0.022 | -0.026 |
| -1.645000000000071 | 0.046 | -0.023 | -0.026 |
| -1.640000000000072 | 0.047 | -0.024 | -0.026 |
| -1.635000000000072 | 0.047 | -0.025 | -0.026 |
| -1.630000000000072 | 0.048 | -0.026 | -0.026 |
| -1.625000000000072 | 0.049 | -0.027 | -0.026 |
| -1.620000000000072 | 0.049 | -0.027 | -0.027 |
| -1.615000000000072 | 0.05 | -0.028 | -0.027 |
| -1.610000000000072 | 0.051 | -0.029 | -0.027 |
| -1.605000000000072 | 0.052 | -0.03 | -0.027 |
| -1.600000000000072 | 0.052 | -0.031 | -0.027 |
| -1.595000000000073 | 0.053 | -0.032 | -0.028 |
| -1.590000000000073 | 0.054 | -0.033 | -0.028 |
| -1.585000000000073 | 0.055 | -0.033 | -0.028 |
| -1.580000000000073 | 0.056 | -0.034 | -0.028 |
| -1.575000000000073 | 0.056 | -0.035 | -0.028 |
| -1.570000000000073 | 0.057 | -0.036 | -0.029 |
| -1.565000000000073 | 0.058 | -0.037 | -0.029 |
| -1.560000000000073 | 0.059 | -0.038 | -0.029 |
| -1.555000000000073 | 0.06 | -0.038 | -0.029 |
| -1.550000000000074 | 0.061 | -0.039 | -0.029 |
| -1.545000000000074 | 0.062 | -0.04 | -0.03 |
| -1.540000000000074 | 0.063 | -0.041 | -0.03 |
| -1.535000000000074 | 0.064 | -0.042 | -0.03 |
| -1.530000000000074 | 0.065 | -0.043 | -0.03 |
| -1.525000000000074 | 0.066 | -0.043 | -0.03 |
| -1.520000000000074 | 0.067 | -0.044 | -0.031 |
| -1.515000000000074 | 0.068 | -0.045 | -0.031 |
| -1.510000000000074 | 0.069 | -0.046 | -0.031 |
| -1.505000000000074 | 0.07 | -0.047 | -0.031 |
| -1.500000000000075 | 0.072 | -0.048 | -0.031 |
| -1.495000000000075 | 0.073 | -0.049 | -0.032 |
| -1.490000000000075 | 0.074 | -0.049 | -0.032 |
| -1.485000000000075 | 0.075 | -0.05 | -0.032 |
| -1.480000000000075 | 0.077 | -0.051 | -0.032 |
| -1.475000000000075 | 0.078 | -0.052 | -0.033 |
| -1.470000000000075 | 0.079 | -0.053 | -0.033 |
| -1.465000000000075 | 0.081 | -0.054 | -0.033 |
| -1.460000000000075 | 0.082 | -0.055 | -0.033 |
| -1.455000000000076 | 0.083 | -0.055 | -0.034 |
| -1.450000000000076 | 0.085 | -0.056 | -0.034 |
| -1.445000000000076 | 0.086 | -0.057 | -0.034 |
| -1.440000000000076 | 0.088 | -0.058 | -0.034 |
| -1.435000000000076 | 0.09 | -0.059 | -0.034 |
| -1.430000000000076 | 0.091 | -0.06 | -0.035 |
| -1.425000000000076 | 0.093 | -0.061 | -0.035 |
| -1.420000000000076 | 0.095 | -0.061 | -0.035 |
| -1.415000000000076 | 0.096 | -0.062 | -0.035 |
| -1.410000000000077 | 0.098 | -0.063 | -0.036 |
| -1.405000000000077 | 0.1 | -0.064 | -0.036 |
| -1.400000000000077 | 0.102 | -0.065 | -0.036 |
| -1.395000000000077 | 0.104 | -0.066 | -0.036 |
| -1.390000000000077 | 0.106 | -0.067 | -0.037 |
| -1.385000000000077 | 0.108 | -0.068 | -0.037 |
| -1.380000000000077 | 0.11 | -0.069 | -0.037 |
| -1.375000000000077 | 0.112 | -0.07 | -0.038 |
| -1.370000000000077 | 0.114 | -0.07 | -0.038 |
| -1.365000000000077 | 0.116 | -0.071 | -0.038 |
| -1.360000000000078 | 0.119 | -0.072 | -0.038 |
| -1.355000000000078 | 0.121 | -0.073 | -0.039 |
| -1.350000000000078 | 0.123 | -0.074 | -0.039 |
| -1.345000000000078 | 0.126 | -0.075 | -0.039 |
| -1.340000000000078 | 0.129 | -0.076 | -0.04 |
| -1.335000000000078 | 0.131 | -0.077 | -0.04 |
| -1.330000000000078 | 0.134 | -0.078 | -0.04 |
| -1.325000000000078 | 0.137 | -0.079 | -0.04 |
| -1.320000000000078 | 0.14 | -0.08 | -0.041 |
| -1.315000000000079 | 0.143 | -0.081 | -0.041 |
| -1.310000000000079 | 0.146 | -0.082 | -0.041 |
| -1.305000000000079 | 0.149 | -0.083 | -0.042 |
| -1.300000000000079 | 0.152 | -0.084 | -0.042 |
| -1.295000000000079 | 0.155 | -0.085 | -0.042 |
| -1.29000000000008 | 0.159 | -0.086 | -0.043 |
| -1.285000000000079 | 0.162 | -0.087 | -0.043 |
| -1.280000000000079 | 0.166 | -0.088 | -0.043 |
| -1.275000000000079 | 0.17 | -0.089 | -0.044 |
| -1.270000000000079 | 0.174 | -0.09 | -0.044 |
| -1.26500000000008 | 0.178 | -0.091 | -0.044 |
| -1.26000000000008 | 0.182 | -0.092 | -0.045 |
| -1.25500000000008 | 0.186 | -0.093 | -0.045 |
| -1.25000000000008 | 0.191 | -0.094 | -0.045 |
| -1.24500000000008 | 0.195 | -0.095 | -0.046 |
| -1.24000000000008 | 0.2 | -0.096 | -0.046 |
| -1.23500000000008 | 0.205 | -0.097 | -0.046 |
| -1.23000000000008 | 0.21 | -0.098 | -0.047 |
| -1.22500000000008 | 0.216 | -0.099 | -0.047 |
| -1.220000000000081 | 0.221 | -0.1 | -0.047 |
| -1.215000000000081 | 0.227 | -0.101 | -0.048 |
| -1.210000000000081 | 0.233 | -0.103 | -0.048 |
| -1.205000000000081 | 0.239 | -0.104 | -0.048 |
| -1.200000000000081 | 0.246 | -0.105 | -0.049 |
| -1.195000000000081 | 0.252 | -0.106 | -0.049 |
| -1.190000000000081 | 0.259 | -0.107 | -0.05 |
| -1.185000000000081 | 0.267 | -0.108 | -0.05 |
| -1.180000000000081 | 0.274 | -0.109 | -0.05 |
| -1.175000000000082 | 0.282 | -0.111 | -0.051 |
| -1.170000000000082 | 0.29 | -0.112 | -0.051 |
| -1.165000000000082 | 0.299 | -0.113 | -0.052 |
| -1.160000000000082 | 0.308 | -0.114 | -0.052 |
| -1.155000000000082 | 0.318 | -0.115 | -0.052 |
| -1.150000000000082 | 0.328 | -0.117 | -0.053 |
| -1.145000000000082 | 0.338 | -0.118 | -0.053 |
| -1.140000000000082 | 0.349 | -0.119 | -0.054 |
| -1.135000000000082 | 0.361 | -0.12 | -0.054 |
| -1.130000000000082 | 0.373 | -0.122 | -0.055 |
| -1.125000000000083 | 0.386 | -0.123 | -0.055 |
| -1.120000000000083 | 0.399 | -0.124 | -0.056 |
| -1.115000000000083 | 0.414 | -0.125 | -0.056 |
| -1.110000000000083 | 0.429 | -0.127 | -0.056 |
| -1.105000000000083 | 0.445 | -0.128 | -0.057 |
| -1.100000000000083 | 0.462 | -0.129 | -0.057 |
| -1.095000000000083 | 0.481 | -0.131 | -0.058 |
| -1.090000000000083 | 0.501 | -0.132 | -0.058 |
| -1.085000000000083 | 0.522 | -0.134 | -0.059 |
| -1.080000000000084 | 0.545 | -0.135 | -0.059 |
| -1.075000000000084 | 0.57 | -0.136 | -0.06 |
| -1.070000000000084 | 0.597 | -0.138 | -0.06 |
| -1.065000000000084 | 0.626 | -0.139 | -0.061 |
| -1.060000000000084 | 0.659 | -0.141 | -0.061 |
| -1.055000000000084 | 0.694 | -0.142 | -0.062 |
| -1.050000000000084 | 0.734 | -0.144 | -0.063 |
| -1.045000000000084 | 0.779 | -0.145 | -0.063 |
| -1.040000000000084 | 0.83 | -0.147 | -0.064 |
| -1.035000000000085 | 0.889 | -0.148 | -0.064 |
| -1.030000000000085 | 0.958 | -0.15 | -0.065 |
| -1.025000000000085 | 1.04 | -0.151 | -0.065 |
| -1.020000000000085 | 1.144 | -0.153 | -0.066 |
| -1.015000000000085 | 1.279 | -0.154 | -0.067 |
| -1.010000000000085 | 1.473 | -0.156 | -0.067 |
| -1.005000000000085 | 1.811 | -0.158 | -0.068 |
| -1.000000000000085 | 14.2 | -0.159 | -0.068 |
| -0.995000000000085 | 1.794 | -0.161 | -0.069 |
| -0.990000000000085 | 1.438 | -0.163 | -0.07 |
| -0.985000000000085 | 1.227 | -0.164 | -0.07 |
| -0.980000000000085 | 1.074 | -0.166 | -0.071 |
| -0.975000000000085 | 0.953 | -0.168 | -0.072 |
| -0.970000000000085 | 0.852 | -0.17 | -0.072 |
| -0.965000000000085 | 0.766 | -0.171 | -0.073 |
| -0.960000000000085 | 0.69 | -0.173 | -0.074 |
| -0.955000000000085 | 0.621 | -0.175 | -0.074 |
| -0.950000000000085 | 0.559 | -0.177 | -0.075 |
| -0.945000000000085 | 0.501 | -0.179 | -0.076 |
| -0.940000000000085 | 0.448 | -0.181 | -0.077 |
| -0.935000000000085 | 0.397 | -0.183 | -0.077 |
| -0.930000000000085 | 0.35 | -0.185 | -0.078 |
| -0.925000000000085 | 0.305 | -0.187 | -0.079 |
| -0.920000000000085 | 0.263 | -0.189 | -0.08 |
| -0.915000000000085 | 0.222 | -0.191 | -0.08 |
| -0.910000000000085 | 0.182 | -0.193 | -0.081 |
| -0.905000000000085 | 0.144 | -0.195 | -0.082 |
| -0.900000000000085 | 0.108 | -0.197 | -0.083 |
| -0.895000000000085 | 0.072 | -0.199 | -0.084 |
| -0.890000000000085 | 0.038 | -0.202 | -0.085 |
| -0.885000000000085 | 0.004 | -0.204 | -0.085 |
| -0.880000000000085 | -0.029 | -0.206 | -0.086 |
| -0.875000000000085 | -0.061 | -0.208 | -0.087 |
| -0.870000000000085 | -0.093 | -0.211 | -0.088 |
| -0.865000000000085 | -0.124 | -0.213 | -0.089 |
| -0.860000000000085 | -0.154 | -0.215 | -0.09 |
| -0.855000000000085 | -0.184 | -0.218 | -0.091 |
| -0.850000000000085 | -0.214 | -0.22 | -0.092 |
| -0.845000000000085 | -0.243 | -0.223 | -0.093 |
| -0.840000000000085 | -0.272 | -0.225 | -0.094 |
| -0.835000000000085 | -0.3 | -0.228 | -0.095 |
| -0.830000000000085 | -0.328 | -0.231 | -0.096 |
| -0.825000000000085 | -0.356 | -0.233 | -0.097 |
| -0.820000000000085 | -0.384 | -0.236 | -0.098 |
| -0.815000000000085 | -0.412 | -0.239 | -0.099 |
| -0.810000000000085 | -0.439 | -0.241 | -0.1 |
| -0.805000000000085 | -0.466 | -0.244 | -0.102 |
| -0.800000000000085 | -0.494 | -0.247 | -0.103 |
| -0.795000000000085 | -0.521 | -0.25 | -0.104 |
| -0.790000000000085 | -0.548 | -0.253 | -0.105 |
| -0.785000000000085 | -0.575 | -0.256 | -0.106 |
| -0.780000000000085 | -0.602 | -0.259 | -0.108 |
| -0.775000000000085 | -0.628 | -0.262 | -0.109 |
| -0.770000000000085 | -0.655 | -0.265 | -0.11 |
| -0.765000000000085 | -0.682 | -0.269 | -0.111 |
| -0.760000000000085 | -0.709 | -0.272 | -0.113 |
| -0.755000000000085 | -0.736 | -0.275 | -0.114 |
| -0.750000000000085 | -0.763 | -0.279 | -0.115 |
| -0.745000000000085 | -0.79 | -0.282 | -0.117 |
| -0.740000000000085 | -0.818 | -0.286 | -0.118 |
| -0.735000000000085 | -0.845 | -0.289 | -0.12 |
| -0.730000000000085 | -0.872 | -0.293 | -0.121 |
| -0.725000000000085 | -0.9 | -0.297 | -0.123 |
| -0.720000000000085 | -0.928 | -0.301 | -0.124 |
| -0.715000000000085 | -0.956 | -0.305 | -0.126 |
| -0.710000000000085 | -0.984 | -0.308 | -0.128 |
| -0.705000000000085 | -1.012 | -0.313 | -0.129 |
| -0.700000000000085 | -1.04 | -0.317 | -0.131 |
| -0.695000000000085 | -1.069 | -0.321 | -0.133 |
| -0.690000000000085 | -1.098 | -0.325 | -0.134 |
| -0.685000000000085 | -1.127 | -0.329 | -0.136 |
| -0.680000000000085 | -1.157 | -0.334 | -0.138 |
| -0.675000000000085 | -1.186 | -0.338 | -0.14 |
| -0.670000000000085 | -1.216 | -0.343 | -0.142 |
| -0.665000000000085 | -1.247 | -0.348 | -0.144 |
| -0.660000000000085 | -1.277 | -0.353 | -0.146 |
| -0.655000000000085 | -1.308 | -0.358 | -0.148 |
| -0.650000000000085 | -1.34 | -0.363 | -0.15 |
| -0.645000000000085 | -1.371 | -0.368 | -0.152 |
| -0.640000000000085 | -1.404 | -0.373 | -0.154 |
| -0.635000000000085 | -1.436 | -0.378 | -0.157 |
| -0.630000000000085 | -1.469 | -0.384 | -0.159 |
| -0.625000000000085 | -1.502 | -0.389 | -0.161 |
| -0.620000000000085 | -1.536 | -0.395 | -0.164 |
| -0.615000000000085 | -1.571 | -0.401 | -0.166 |
| -0.610000000000085 | -1.605 | -0.407 | -0.169 |
| -0.605000000000085 | -1.641 | -0.413 | -0.171 |
| -0.600000000000085 | -1.677 | -0.42 | -0.174 |
| -0.595000000000085 | -1.713 | -0.426 | -0.177 |
| -0.590000000000085 | -1.75 | -0.433 | -0.179 |
| -0.585000000000085 | -1.788 | -0.439 | -0.182 |
| -0.580000000000085 | -1.826 | -0.446 | -0.185 |
| -0.575000000000085 | -1.865 | -0.453 | -0.188 |
| -0.570000000000085 | -1.905 | -0.461 | -0.191 |
| -0.565000000000085 | -1.945 | -0.468 | -0.194 |
| -0.560000000000085 | -1.986 | -0.476 | -0.198 |
| -0.555000000000085 | -2.028 | -0.483 | -0.201 |
| -0.550000000000085 | -2.071 | -0.491 | -0.204 |
| -0.545000000000085 | -2.114 | -0.5 | -0.208 |
| -0.540000000000085 | -2.158 | -0.508 | -0.211 |
| -0.535000000000085 | -2.204 | -0.517 | -0.215 |
| -0.530000000000085 | -2.25 | -0.526 | -0.219 |
| -0.525000000000085 | -2.297 | -0.535 | -0.223 |
| -0.520000000000085 | -2.345 | -0.544 | -0.227 |
| -0.515000000000085 | -2.395 | -0.554 | -0.231 |
| -0.510000000000085 | -2.445 | -0.564 | -0.235 |
| -0.505000000000085 | -2.497 | -0.574 | -0.24 |
| -0.500000000000085 | -2.549 | -0.585 | -0.244 |
| -0.495000000000085 | -2.603 | -0.595 | -0.249 |
| -0.490000000000085 | -2.659 | -0.607 | -0.254 |
| -0.485000000000085 | -2.715 | -0.618 | -0.259 |
| -0.480000000000085 | -2.773 | -0.63 | -0.264 |
| -0.475000000000085 | -2.833 | -0.642 | -0.269 |
| -0.470000000000085 | -2.894 | -0.655 | -0.274 |
| -0.465000000000085 | -2.956 | -0.668 | -0.28 |
| -0.460000000000085 | -3.021 | -0.681 | -0.286 |
| -0.455000000000085 | -3.087 | -0.695 | -0.291 |
| -0.450000000000085 | -3.155 | -0.709 | -0.298 |
| -0.445000000000085 | -3.224 | -0.724 | -0.304 |
| -0.440000000000085 | -3.296 | -0.739 | -0.311 |
| -0.435000000000085 | -3.37 | -0.754 | -0.317 |
| -0.430000000000085 | -3.446 | -0.771 | -0.324 |
| -0.425000000000085 | -3.524 | -0.787 | -0.332 |
| -0.420000000000085 | -3.605 | -0.805 | -0.339 |
| -0.415000000000085 | -3.688 | -0.823 | -0.347 |
| -0.410000000000085 | -3.774 | -0.841 | -0.355 |
| -0.405000000000085 | -3.863 | -0.861 | -0.363 |
| -0.400000000000085 | -3.954 | -0.881 | -0.372 |
| -0.395000000000085 | -4.049 | -0.901 | -0.381 |
| -0.390000000000085 | -4.146 | -0.923 | -0.39 |
| -0.385000000000085 | -4.248 | -0.945 | -0.4 |
| -0.380000000000085 | -4.352 | -0.968 | -0.41 |
| -0.375000000000085 | -4.461 | -0.992 | -0.421 |
| -0.370000000000085 | -4.573 | -1.017 | -0.432 |
| -0.365000000000085 | -4.689 | -1.044 | -0.443 |
| -0.360000000000085 | -4.81 | -1.071 | -0.455 |
| -0.355000000000085 | -4.936 | -1.099 | -0.467 |
| -0.350000000000085 | -5.066 | -1.128 | -0.48 |
| -0.345000000000085 | -5.202 | -1.159 | -0.493 |
| -0.340000000000085 | -5.343 | -1.191 | -0.507 |
| -0.335000000000085 | -5.489 | -1.225 | -0.522 |
| -0.330000000000085 | -5.642 | -1.26 | -0.537 |
| -0.325000000000085 | -5.802 | -1.296 | -0.553 |
| -0.320000000000085 | -5.968 | -1.334 | -0.57 |
| -0.315000000000085 | -6.142 | -1.374 | -0.588 |
| -0.310000000000085 | -6.324 | -1.416 | -0.606 |
| -0.305000000000085 | -6.514 | -1.461 | -0.625 |
| -0.300000000000085 | -6.712 | -1.507 | -0.646 |
| -0.295000000000085 | -6.921 | -1.555 | -0.667 |
| -0.290000000000085 | -7.139 | -1.606 | -0.689 |
| -0.285000000000085 | -7.369 | -1.66 | -0.713 |
| -0.280000000000085 | -7.61 | -1.717 | -0.738 |
| -0.275000000000085 | -7.863 | -1.776 | -0.764 |
| -0.270000000000085 | -8.13 | -1.839 | -0.792 |
| -0.265000000000085 | -8.412 | -1.906 | -0.821 |
| -0.260000000000085 | -8.709 | -1.976 | -0.852 |
| -0.255000000000085 | -9.022 | -2.051 | -0.885 |
| -0.250000000000085 | -9.354 | -2.129 | -0.92 |
| -0.245000000000085 | -9.705 | -2.213 | -0.956 |
| -0.240000000000085 | -10.078 | -2.302 | -0.996 |
| -0.235000000000085 | -10.474 | -2.397 | -1.037 |
| -0.230000000000085 | -10.894 | -2.498 | -1.082 |
| -0.225000000000085 | -11.342 | -2.605 | -1.129 |
| -0.220000000000085 | -11.82 | -2.72 | -1.18 |
| -0.215000000000085 | -12.33 | -2.843 | -1.234 |
| -0.210000000000085 | -12.876 | -2.975 | -1.293 |
| -0.205000000000085 | -13.461 | -3.116 | -1.355 |
| -0.200000000000085 | -14.089 | -3.269 | -1.422 |
| -0.195000000000085 | -14.765 | -3.433 | -1.495 |
| -0.190000000000085 | -15.493 | -3.609 | -1.573 |
| -0.185000000000085 | -16.279 | -3.801 | -1.658 |
| -0.180000000000085 | -17.13 | -4.008 | -1.749 |
| -0.175000000000085 | -18.054 | -4.234 | -1.849 |
| -0.170000000000085 | -19.058 | -4.479 | -1.958 |
| -0.165000000000085 | -20.153 | -4.747 | -2.076 |
| -0.160000000000085 | -21.351 | -5.04 | -2.206 |
| -0.155000000000084 | -22.664 | -5.363 | -2.349 |
| -0.150000000000084 | -24.108 | -5.717 | -2.506 |
| -0.145000000000084 | -25.702 | -6.109 | -2.68 |
| -0.140000000000084 | -27.466 | -6.544 | -2.872 |
| -0.135000000000084 | -29.428 | -7.027 | -3.087 |
| -0.130000000000084 | -31.617 | -7.567 | -3.326 |
| -0.125000000000084 | -34.072 | -8.173 | -3.595 |
| -0.120000000000084 | -36.835 | -8.856 | -3.898 |
| -0.115000000000084 | -39.963 | -9.63 | -4.241 |
| -0.110000000000084 | -43.524 | -10.512 | -4.632 |
| -0.105000000000084 | -47.6 | -11.522 | -5.08 |
| -0.100000000000084 | -52.298 | -12.687 | -5.598 |
| -0.0950000000000844 | -57.751 | -14.041 | -6.198 |
| -0.0900000000000844 | -64.132 | -15.626 | -6.902 |
| -0.0850000000000844 | -71.666 | -17.498 | -7.733 |
| -0.0800000000000844 | -80.648 | -19.732 | -8.725 |
| -0.0750000000000844 | -91.476 | -22.427 | -9.922 |
| -0.0700000000000844 | -104.698 | -25.72 | -11.384 |
| -0.0650000000000844 | -121.074 | -29.8 | -13.197 |
| -0.0600000000000844 | -141.7 | -34.941 | -15.48 |
| -0.0550000000000844 | -168.188 | -41.547 | -18.415 |
| -0.0500000000000844 | -202.994 | -50.231 | -22.273 |
| -0.0450000000000844 | -250.014 | -61.966 | -27.487 |
| -0.0400000000000844 | -315.718 | -78.369 | -34.776 |
| -0.0350000000000844 | -411.515 | -102.294 | -45.406 |
| -0.0300000000000844 | -559.062 | -139.151 | -61.785 |
| -0.0250000000000844 | -803.689 | -200.274 | -88.948 |
| -0.0200000000000844 | -1253.912 | -312.788 | -138.951 |
| -0.0150000000000844 | -2226.422 | -555.861 | -246.979 |
| -0.0100000000000844 | -5004.605 | -1250.331 | -555.626 |
| -0.00500000000008444 | -20005.298 | -5000.374 | -2222.301 |
| -8.4444604087075e-14 | -70117463416798098246074368 | -17529365854199500939198464 | -7790829268533120476381184 |
| 0.00499999999991555 | -20005.298 | -5000.374 | -2222.301 |
| 0.00999999999991555 | -5004.605 | -1250.331 | -555.626 |
| 0.0149999999999156 | -2226.422 | -555.861 | -246.979 |
| 0.0199999999999156 | -1253.912 | -312.788 | -138.951 |
| 0.0249999999999156 | -803.689 | -200.274 | -88.948 |
| 0.0299999999999156 | -559.062 | -139.151 | -61.785 |
| 0.0349999999999155 | -411.515 | -102.294 | -45.406 |
| 0.0399999999999155 | -315.718 | -78.369 | -34.776 |
| 0.0449999999999155 | -250.014 | -61.966 | -27.487 |
| 0.0499999999999155 | -202.994 | -50.231 | -22.273 |
| 0.0549999999999155 | -168.188 | -41.547 | -18.415 |
| 0.0599999999999155 | -141.7 | -34.941 | -15.48 |
| 0.0649999999999155 | -121.074 | -29.8 | -13.197 |
| 0.0699999999999155 | -104.698 | -25.72 | -11.384 |
| 0.0749999999999155 | -91.476 | -22.427 | -9.922 |
| 0.0799999999999155 | -80.648 | -19.732 | -8.725 |
| 0.0849999999999155 | -71.666 | -17.498 | -7.733 |
| 0.0899999999999155 | -64.132 | -15.626 | -6.902 |
| 0.0949999999999155 | -57.751 | -14.041 | -6.198 |
| 0.0999999999999155 | -52.298 | -12.687 | -5.598 |
| 0.104999999999916 | -47.6 | -11.522 | -5.08 |
| 0.109999999999916 | -43.524 | -10.512 | -4.632 |
| 0.114999999999916 | -39.963 | -9.63 | -4.241 |
| 0.119999999999916 | -36.835 | -8.856 | -3.898 |
| 0.124999999999916 | -34.072 | -8.173 | -3.595 |
| 0.129999999999916 | -31.617 | -7.567 | -3.326 |
| 0.134999999999916 | -29.428 | -7.027 | -3.087 |
| 0.139999999999916 | -27.466 | -6.544 | -2.872 |
| 0.144999999999916 | -25.702 | -6.109 | -2.68 |
| 0.149999999999916 | -24.108 | -5.717 | -2.506 |
| 0.154999999999916 | -22.664 | -5.363 | -2.349 |
| 0.159999999999916 | -21.351 | -5.04 | -2.206 |
| 0.164999999999916 | -20.153 | -4.747 | -2.076 |
| 0.169999999999916 | -19.058 | -4.479 | -1.958 |
| 0.174999999999916 | -18.054 | -4.234 | -1.849 |
| 0.179999999999916 | -17.13 | -4.008 | -1.749 |
| 0.184999999999916 | -16.279 | -3.801 | -1.658 |
| 0.189999999999916 | -15.493 | -3.609 | -1.573 |
| 0.194999999999916 | -14.765 | -3.433 | -1.495 |
| 0.199999999999916 | -14.089 | -3.269 | -1.422 |
| 0.204999999999916 | -13.461 | -3.116 | -1.355 |
| 0.209999999999916 | -12.876 | -2.975 | -1.293 |
| 0.214999999999916 | -12.33 | -2.843 | -1.234 |
| 0.219999999999916 | -11.82 | -2.72 | -1.18 |
| 0.224999999999916 | -11.342 | -2.605 | -1.129 |
| 0.229999999999916 | -10.894 | -2.498 | -1.082 |
| 0.234999999999916 | -10.474 | -2.397 | -1.037 |
| 0.239999999999916 | -10.078 | -2.302 | -0.996 |
| 0.244999999999916 | -9.705 | -2.213 | -0.956 |
| 0.249999999999916 | -9.354 | -2.129 | -0.92 |
| 0.254999999999916 | -9.022 | -2.051 | -0.885 |
| 0.259999999999916 | -8.709 | -1.976 | -0.852 |
| 0.264999999999916 | -8.412 | -1.906 | -0.821 |
| 0.269999999999916 | -8.13 | -1.839 | -0.792 |
| 0.274999999999916 | -7.863 | -1.776 | -0.764 |
| 0.279999999999916 | -7.61 | -1.717 | -0.738 |
| 0.284999999999916 | -7.369 | -1.66 | -0.713 |
| 0.289999999999916 | -7.139 | -1.606 | -0.689 |
| 0.294999999999916 | -6.921 | -1.555 | -0.667 |
| 0.299999999999916 | -6.712 | -1.507 | -0.646 |
| 0.304999999999916 | -6.514 | -1.461 | -0.625 |
| 0.309999999999916 | -6.324 | -1.416 | -0.606 |
| 0.314999999999916 | -6.142 | -1.374 | -0.588 |
| 0.319999999999916 | -5.968 | -1.334 | -0.57 |
| 0.324999999999916 | -5.802 | -1.296 | -0.553 |
| 0.329999999999916 | -5.642 | -1.26 | -0.537 |
| 0.334999999999916 | -5.489 | -1.225 | -0.522 |
| 0.339999999999916 | -5.343 | -1.191 | -0.507 |
| 0.344999999999916 | -5.202 | -1.159 | -0.493 |
| 0.349999999999916 | -5.066 | -1.128 | -0.48 |
| 0.354999999999916 | -4.936 | -1.099 | -0.467 |
| 0.359999999999916 | -4.81 | -1.071 | -0.455 |
| 0.364999999999916 | -4.689 | -1.044 | -0.443 |
| 0.369999999999916 | -4.573 | -1.017 | -0.432 |
| 0.374999999999916 | -4.461 | -0.992 | -0.421 |
| 0.379999999999916 | -4.352 | -0.968 | -0.41 |
| 0.384999999999916 | -4.248 | -0.945 | -0.4 |
| 0.389999999999916 | -4.146 | -0.923 | -0.39 |
| 0.394999999999916 | -4.049 | -0.901 | -0.381 |
| 0.399999999999916 | -3.954 | -0.881 | -0.372 |
| 0.404999999999916 | -3.863 | -0.861 | -0.363 |
| 0.409999999999916 | -3.774 | -0.841 | -0.355 |
| 0.414999999999916 | -3.688 | -0.823 | -0.347 |
| 0.419999999999916 | -3.605 | -0.805 | -0.339 |
| 0.424999999999916 | -3.524 | -0.787 | -0.332 |
| 0.429999999999916 | -3.446 | -0.771 | -0.324 |
| 0.434999999999916 | -3.37 | -0.754 | -0.317 |
| 0.439999999999916 | -3.296 | -0.739 | -0.311 |
| 0.444999999999916 | -3.224 | -0.724 | -0.304 |
| 0.449999999999916 | -3.155 | -0.709 | -0.298 |
| 0.454999999999916 | -3.087 | -0.695 | -0.291 |
| 0.459999999999916 | -3.021 | -0.681 | -0.286 |
| 0.464999999999916 | -2.956 | -0.668 | -0.28 |
| 0.469999999999916 | -2.894 | -0.655 | -0.274 |
| 0.474999999999916 | -2.833 | -0.642 | -0.269 |
| 0.479999999999916 | -2.773 | -0.63 | -0.264 |
| 0.484999999999916 | -2.715 | -0.618 | -0.259 |
| 0.489999999999916 | -2.659 | -0.607 | -0.254 |
| 0.494999999999916 | -2.603 | -0.595 | -0.249 |
| 0.499999999999916 | -2.549 | -0.585 | -0.244 |
| 0.504999999999916 | -2.497 | -0.574 | -0.24 |
| 0.509999999999916 | -2.445 | -0.564 | -0.235 |
| 0.514999999999916 | -2.395 | -0.554 | -0.231 |
| 0.519999999999916 | -2.345 | -0.544 | -0.227 |
| 0.524999999999916 | -2.297 | -0.535 | -0.223 |
| 0.529999999999916 | -2.25 | -0.526 | -0.219 |
| 0.534999999999916 | -2.204 | -0.517 | -0.215 |
| 0.539999999999916 | -2.158 | -0.508 | -0.211 |
| 0.544999999999916 | -2.114 | -0.5 | -0.208 |
| 0.549999999999916 | -2.071 | -0.491 | -0.204 |
| 0.554999999999916 | -2.028 | -0.483 | -0.201 |
| 0.559999999999916 | -1.986 | -0.476 | -0.198 |
| 0.564999999999916 | -1.945 | -0.468 | -0.194 |
| 0.569999999999916 | -1.905 | -0.461 | -0.191 |
| 0.574999999999916 | -1.865 | -0.453 | -0.188 |
| 0.579999999999916 | -1.826 | -0.446 | -0.185 |
| 0.584999999999916 | -1.788 | -0.439 | -0.182 |
| 0.589999999999916 | -1.75 | -0.433 | -0.179 |
| 0.594999999999916 | -1.713 | -0.426 | -0.177 |
| 0.599999999999916 | -1.677 | -0.42 | -0.174 |
| 0.604999999999916 | -1.641 | -0.413 | -0.171 |
| 0.609999999999916 | -1.605 | -0.407 | -0.169 |
| 0.614999999999916 | -1.571 | -0.401 | -0.166 |
| 0.619999999999916 | -1.536 | -0.395 | -0.164 |
| 0.624999999999916 | -1.502 | -0.389 | -0.161 |
| 0.629999999999916 | -1.469 | -0.384 | -0.159 |
| 0.634999999999916 | -1.436 | -0.378 | -0.157 |
| 0.639999999999916 | -1.404 | -0.373 | -0.154 |
| 0.644999999999916 | -1.371 | -0.368 | -0.152 |
| 0.649999999999916 | -1.34 | -0.363 | -0.15 |
| 0.654999999999916 | -1.308 | -0.358 | -0.148 |
| 0.659999999999916 | -1.277 | -0.353 | -0.146 |
| 0.664999999999916 | -1.247 | -0.348 | -0.144 |
| 0.669999999999916 | -1.216 | -0.343 | -0.142 |
| 0.674999999999916 | -1.186 | -0.338 | -0.14 |
| 0.679999999999916 | -1.157 | -0.334 | -0.138 |
| 0.684999999999916 | -1.127 | -0.329 | -0.136 |
| 0.689999999999916 | -1.098 | -0.325 | -0.134 |
| 0.694999999999916 | -1.069 | -0.321 | -0.133 |
| 0.699999999999916 | -1.04 | -0.317 | -0.131 |
| 0.704999999999916 | -1.012 | -0.313 | -0.129 |
| 0.709999999999916 | -0.984 | -0.308 | -0.128 |
| 0.714999999999916 | -0.956 | -0.305 | -0.126 |
| 0.719999999999916 | -0.928 | -0.301 | -0.124 |
| 0.724999999999916 | -0.9 | -0.297 | -0.123 |
| 0.729999999999916 | -0.872 | -0.293 | -0.121 |
| 0.734999999999916 | -0.845 | -0.289 | -0.12 |
| 0.739999999999916 | -0.818 | -0.286 | -0.118 |
| 0.744999999999916 | -0.79 | -0.282 | -0.117 |
| 0.749999999999916 | -0.763 | -0.279 | -0.115 |
| 0.754999999999916 | -0.736 | -0.275 | -0.114 |
| 0.759999999999916 | -0.709 | -0.272 | -0.113 |
| 0.764999999999916 | -0.682 | -0.269 | -0.111 |
| 0.769999999999916 | -0.655 | -0.265 | -0.11 |
| 0.774999999999916 | -0.628 | -0.262 | -0.109 |
| 0.779999999999916 | -0.602 | -0.259 | -0.108 |
| 0.784999999999916 | -0.575 | -0.256 | -0.106 |
| 0.789999999999916 | -0.548 | -0.253 | -0.105 |
| 0.794999999999916 | -0.521 | -0.25 | -0.104 |
| 0.799999999999916 | -0.494 | -0.247 | -0.103 |
| 0.804999999999916 | -0.466 | -0.244 | -0.102 |
| 0.809999999999916 | -0.439 | -0.241 | -0.1 |
| 0.814999999999916 | -0.412 | -0.239 | -0.099 |
| 0.819999999999916 | -0.384 | -0.236 | -0.098 |
| 0.824999999999916 | -0.356 | -0.233 | -0.097 |
| 0.829999999999916 | -0.328 | -0.231 | -0.096 |
| 0.834999999999916 | -0.3 | -0.228 | -0.095 |
| 0.839999999999916 | -0.272 | -0.225 | -0.094 |
| 0.844999999999916 | -0.243 | -0.223 | -0.093 |
| 0.849999999999916 | -0.214 | -0.22 | -0.092 |
| 0.854999999999916 | -0.184 | -0.218 | -0.091 |
| 0.859999999999916 | -0.154 | -0.215 | -0.09 |
| 0.864999999999916 | -0.124 | -0.213 | -0.089 |
| 0.869999999999916 | -0.093 | -0.211 | -0.088 |
| 0.874999999999916 | -0.061 | -0.208 | -0.087 |
| 0.879999999999916 | -0.029 | -0.206 | -0.086 |
| 0.884999999999916 | 0.004 | -0.204 | -0.085 |
| 0.889999999999916 | 0.038 | -0.202 | -0.085 |
| 0.894999999999916 | 0.072 | -0.199 | -0.084 |
| 0.899999999999916 | 0.108 | -0.197 | -0.083 |
| 0.904999999999916 | 0.144 | -0.195 | -0.082 |
| 0.909999999999916 | 0.182 | -0.193 | -0.081 |
| 0.914999999999916 | 0.222 | -0.191 | -0.08 |
| 0.919999999999916 | 0.263 | -0.189 | -0.08 |
| 0.924999999999916 | 0.305 | -0.187 | -0.079 |
| 0.929999999999916 | 0.35 | -0.185 | -0.078 |
| 0.934999999999916 | 0.397 | -0.183 | -0.077 |
| 0.939999999999916 | 0.448 | -0.181 | -0.077 |
| 0.944999999999916 | 0.501 | -0.179 | -0.076 |
| 0.949999999999916 | 0.559 | -0.177 | -0.075 |
| 0.954999999999916 | 0.621 | -0.175 | -0.074 |
| 0.959999999999916 | 0.69 | -0.173 | -0.074 |
| 0.964999999999916 | 0.766 | -0.171 | -0.073 |
| 0.969999999999916 | 0.852 | -0.17 | -0.072 |
| 0.974999999999916 | 0.953 | -0.168 | -0.072 |
| 0.979999999999916 | 1.074 | -0.166 | -0.071 |
| 0.984999999999916 | 1.227 | -0.164 | -0.07 |
| 0.989999999999916 | 1.438 | -0.163 | -0.07 |
| 0.994999999999916 | 1.794 | -0.161 | -0.069 |
| 0.999999999999916 | 14.209 | -0.159 | -0.068 |
| 1.004999999999916 | 1.811 | -0.158 | -0.068 |
| 1.009999999999916 | 1.473 | -0.156 | -0.067 |
| 1.014999999999916 | 1.279 | -0.154 | -0.067 |
| 1.019999999999916 | 1.144 | -0.153 | -0.066 |
| 1.024999999999916 | 1.04 | -0.151 | -0.065 |
| 1.029999999999916 | 0.958 | -0.15 | -0.065 |
| 1.034999999999916 | 0.889 | -0.148 | -0.064 |
| 1.039999999999915 | 0.83 | -0.147 | -0.064 |
| 1.044999999999915 | 0.779 | -0.145 | -0.063 |
| 1.049999999999915 | 0.734 | -0.144 | -0.063 |
| 1.054999999999915 | 0.694 | -0.142 | -0.062 |
| 1.059999999999915 | 0.659 | -0.141 | -0.061 |
| 1.064999999999915 | 0.626 | -0.139 | -0.061 |
| 1.069999999999915 | 0.597 | -0.138 | -0.06 |
| 1.074999999999915 | 0.57 | -0.136 | -0.06 |
| 1.079999999999915 | 0.545 | -0.135 | -0.059 |
| 1.084999999999914 | 0.522 | -0.134 | -0.059 |
| 1.089999999999914 | 0.501 | -0.132 | -0.058 |
| 1.094999999999914 | 0.481 | -0.131 | -0.058 |
| 1.099999999999914 | 0.462 | -0.129 | -0.057 |
| 1.104999999999914 | 0.445 | -0.128 | -0.057 |
| 1.109999999999914 | 0.429 | -0.127 | -0.056 |
| 1.114999999999914 | 0.414 | -0.125 | -0.056 |
| 1.119999999999914 | 0.399 | -0.124 | -0.056 |
| 1.124999999999914 | 0.386 | -0.123 | -0.055 |
| 1.129999999999914 | 0.373 | -0.122 | -0.055 |
| 1.134999999999913 | 0.361 | -0.12 | -0.054 |
| 1.139999999999913 | 0.349 | -0.119 | -0.054 |
| 1.144999999999913 | 0.338 | -0.118 | -0.053 |
| 1.149999999999913 | 0.328 | -0.117 | -0.053 |
| 1.154999999999913 | 0.318 | -0.115 | -0.052 |
| 1.159999999999913 | 0.308 | -0.114 | -0.052 |
| 1.164999999999913 | 0.299 | -0.113 | -0.052 |
| 1.169999999999913 | 0.29 | -0.112 | -0.051 |
| 1.174999999999913 | 0.282 | -0.111 | -0.051 |
| 1.179999999999912 | 0.274 | -0.109 | -0.05 |
| 1.184999999999912 | 0.267 | -0.108 | -0.05 |
| 1.189999999999912 | 0.259 | -0.107 | -0.05 |
| 1.194999999999912 | 0.252 | -0.106 | -0.049 |
| 1.199999999999912 | 0.246 | -0.105 | -0.049 |
| 1.204999999999912 | 0.239 | -0.104 | -0.048 |
| 1.209999999999912 | 0.233 | -0.103 | -0.048 |
| 1.214999999999912 | 0.227 | -0.101 | -0.048 |
| 1.219999999999912 | 0.221 | -0.1 | -0.047 |
| 1.224999999999911 | 0.216 | -0.099 | -0.047 |
| 1.229999999999911 | 0.21 | -0.098 | -0.047 |
| 1.234999999999911 | 0.205 | -0.097 | -0.046 |
| 1.239999999999911 | 0.2 | -0.096 | -0.046 |
| 1.244999999999911 | 0.195 | -0.095 | -0.046 |
| 1.249999999999911 | 0.191 | -0.094 | -0.045 |
| 1.254999999999911 | 0.186 | -0.093 | -0.045 |
| 1.259999999999911 | 0.182 | -0.092 | -0.045 |
| 1.264999999999911 | 0.178 | -0.091 | -0.044 |
| 1.269999999999911 | 0.174 | -0.09 | -0.044 |
| 1.27499999999991 | 0.17 | -0.089 | -0.044 |
| 1.27999999999991 | 0.166 | -0.088 | -0.043 |
| 1.28499999999991 | 0.162 | -0.087 | -0.043 |
| 1.28999999999991 | 0.159 | -0.086 | -0.043 |
| 1.29499999999991 | 0.155 | -0.085 | -0.042 |
| 1.29999999999991 | 0.152 | -0.084 | -0.042 |
| 1.30499999999991 | 0.149 | -0.083 | -0.042 |
| 1.30999999999991 | 0.146 | -0.082 | -0.041 |
| 1.31499999999991 | 0.143 | -0.081 | -0.041 |
| 1.319999999999909 | 0.14 | -0.08 | -0.041 |
| 1.324999999999909 | 0.137 | -0.079 | -0.04 |
| 1.329999999999909 | 0.134 | -0.078 | -0.04 |
| 1.334999999999909 | 0.131 | -0.077 | -0.04 |
| 1.339999999999909 | 0.129 | -0.076 | -0.04 |
| 1.344999999999909 | 0.126 | -0.075 | -0.039 |
| 1.349999999999909 | 0.123 | -0.074 | -0.039 |
| 1.354999999999909 | 0.121 | -0.073 | -0.039 |
| 1.359999999999909 | 0.119 | -0.072 | -0.038 |
| 1.364999999999908 | 0.116 | -0.071 | -0.038 |
| 1.369999999999908 | 0.114 | -0.07 | -0.038 |
| 1.374999999999908 | 0.112 | -0.07 | -0.038 |
| 1.379999999999908 | 0.11 | -0.069 | -0.037 |
| 1.384999999999908 | 0.108 | -0.068 | -0.037 |
| 1.389999999999908 | 0.106 | -0.067 | -0.037 |
| 1.394999999999908 | 0.104 | -0.066 | -0.036 |
| 1.399999999999908 | 0.102 | -0.065 | -0.036 |
| 1.404999999999908 | 0.1 | -0.064 | -0.036 |
| 1.409999999999908 | 0.098 | -0.063 | -0.036 |
| 1.414999999999907 | 0.096 | -0.062 | -0.035 |
| 1.419999999999907 | 0.095 | -0.061 | -0.035 |
| 1.424999999999907 | 0.093 | -0.061 | -0.035 |
| 1.429999999999907 | 0.091 | -0.06 | -0.035 |
| 1.434999999999907 | 0.09 | -0.059 | -0.034 |
| 1.439999999999907 | 0.088 | -0.058 | -0.034 |
| 1.444999999999907 | 0.086 | -0.057 | -0.034 |
| 1.449999999999907 | 0.085 | -0.056 | -0.034 |
| 1.454999999999907 | 0.083 | -0.055 | -0.034 |
| 1.459999999999906 | 0.082 | -0.055 | -0.033 |
| 1.464999999999906 | 0.081 | -0.054 | -0.033 |
| 1.469999999999906 | 0.079 | -0.053 | -0.033 |
| 1.474999999999906 | 0.078 | -0.052 | -0.033 |
| 1.479999999999906 | 0.077 | -0.051 | -0.032 |
| 1.484999999999906 | 0.075 | -0.05 | -0.032 |
| 1.489999999999906 | 0.074 | -0.049 | -0.032 |
| 1.494999999999906 | 0.073 | -0.049 | -0.032 |
| 1.499999999999906 | 0.072 | -0.048 | -0.031 |
| 1.504999999999906 | 0.07 | -0.047 | -0.031 |
| 1.509999999999905 | 0.069 | -0.046 | -0.031 |
| 1.514999999999905 | 0.068 | -0.045 | -0.031 |
| 1.519999999999905 | 0.067 | -0.044 | -0.031 |
| 1.524999999999905 | 0.066 | -0.043 | -0.03 |
| 1.529999999999905 | 0.065 | -0.043 | -0.03 |
| 1.534999999999905 | 0.064 | -0.042 | -0.03 |
| 1.539999999999905 | 0.063 | -0.041 | -0.03 |
| 1.544999999999905 | 0.062 | -0.04 | -0.03 |
| 1.549999999999905 | 0.061 | -0.039 | -0.029 |
| 1.554999999999904 | 0.06 | -0.038 | -0.029 |
| 1.559999999999904 | 0.059 | -0.038 | -0.029 |
| 1.564999999999904 | 0.058 | -0.037 | -0.029 |
| 1.569999999999904 | 0.057 | -0.036 | -0.029 |
| 1.574999999999904 | 0.056 | -0.035 | -0.028 |
| 1.579999999999904 | 0.056 | -0.034 | -0.028 |
| 1.584999999999904 | 0.055 | -0.033 | -0.028 |
| 1.589999999999904 | 0.054 | -0.033 | -0.028 |
| 1.594999999999904 | 0.053 | -0.032 | -0.028 |
| 1.599999999999903 | 0.052 | -0.031 | -0.027 |
| 1.604999999999903 | 0.052 | -0.03 | -0.027 |
| 1.609999999999903 | 0.051 | -0.029 | -0.027 |
| 1.614999999999903 | 0.05 | -0.028 | -0.027 |
| 1.619999999999903 | 0.049 | -0.027 | -0.027 |
| 1.624999999999903 | 0.049 | -0.027 | -0.026 |
| 1.629999999999903 | 0.048 | -0.026 | -0.026 |
| 1.634999999999903 | 0.047 | -0.025 | -0.026 |
| 1.639999999999903 | 0.047 | -0.024 | -0.026 |
| 1.644999999999902 | 0.046 | -0.023 | -0.026 |
| 1.649999999999902 | 0.045 | -0.022 | -0.026 |
| 1.654999999999902 | 0.045 | -0.021 | -0.025 |
| 1.659999999999902 | 0.044 | -0.021 | -0.025 |
| 1.664999999999902 | 0.043 | -0.02 | -0.025 |
| 1.669999999999902 | 0.043 | -0.019 | -0.025 |
| 1.674999999999902 | 0.042 | -0.018 | -0.025 |
| 1.679999999999902 | 0.042 | -0.017 | -0.025 |
| 1.684999999999902 | 0.041 | -0.016 | -0.024 |
| 1.689999999999901 | 0.04 | -0.015 | -0.024 |
| 1.694999999999901 | 0.04 | -0.014 | -0.024 |
| 1.699999999999901 | 0.039 | -0.013 | -0.024 |
| 1.704999999999901 | 0.039 | -0.012 | -0.024 |
| 1.709999999999901 | 0.038 | -0.012 | -0.024 |
| 1.714999999999901 | 0.038 | -0.011 | -0.023 |
| 1.719999999999901 | 0.037 | -0.01 | -0.023 |
| 1.724999999999901 | 0.037 | -0.009 | -0.023 |
| 1.729999999999901 | 0.036 | -0.008 | -0.023 |
| 1.734999999999901 | 0.036 | -0.007 | -0.023 |
| 1.7399999999999 | 0.035 | -0.006 | -0.023 |
| 1.7449999999999 | 0.035 | -0.005 | -0.022 |
| 1.7499999999999 | 0.034 | -0.004 | -0.022 |
| 1.7549999999999 | 0.034 | -0.003 | -0.022 |
| 1.7599999999999 | 0.034 | -0.002 | -0.022 |
| 1.7649999999999 | 0.033 | -0.001 | -0.022 |
| 1.7699999999999 | 0.033 | 0 | -0.022 |
| 1.7749999999999 | 0.032 | 0.001 | -0.021 |
| 1.7799999999999 | 0.032 | 0.002 | -0.021 |
| 1.784999999999899 | 0.031 | 0.003 | -0.021 |
| 1.789999999999899 | 0.031 | 0.005 | -0.021 |
| 1.794999999999899 | 0.031 | 0.006 | -0.021 |
| 1.799999999999899 | 0.03 | 0.007 | -0.021 |
| 1.804999999999899 | 0.03 | 0.008 | -0.021 |
| 1.809999999999899 | 0.029 | 0.009 | -0.02 |
| 1.814999999999899 | 0.029 | 0.01 | -0.02 |
| 1.819999999999899 | 0.029 | 0.011 | -0.02 |
| 1.824999999999899 | 0.028 | 0.013 | -0.02 |
| 1.829999999999899 | 0.028 | 0.014 | -0.02 |
| 1.834999999999898 | 0.028 | 0.015 | -0.02 |
| 1.839999999999898 | 0.027 | 0.016 | -0.02 |
| 1.844999999999898 | 0.027 | 0.018 | -0.019 |
| 1.849999999999898 | 0.027 | 0.019 | -0.019 |
| 1.854999999999898 | 0.026 | 0.02 | -0.019 |
| 1.859999999999898 | 0.026 | 0.022 | -0.019 |
| 1.864999999999898 | 0.026 | 0.023 | -0.019 |
| 1.869999999999898 | 0.025 | 0.025 | -0.019 |
| 1.874999999999898 | 0.025 | 0.026 | -0.019 |
| 1.879999999999897 | 0.025 | 0.028 | -0.018 |
| 1.884999999999897 | 0.025 | 0.03 | -0.018 |
| 1.889999999999897 | 0.024 | 0.031 | -0.018 |
| 1.894999999999897 | 0.024 | 0.033 | -0.018 |
| 1.899999999999897 | 0.024 | 0.035 | -0.018 |
| 1.904999999999897 | 0.023 | 0.037 | -0.018 |
| 1.909999999999897 | 0.023 | 0.039 | -0.018 |
| 1.914999999999897 | 0.023 | 0.041 | -0.017 |
| 1.919999999999897 | 0.023 | 0.043 | -0.017 |
| 1.924999999999897 | 0.022 | 0.045 | -0.017 |
| 1.929999999999896 | 0.022 | 0.048 | -0.017 |
| 1.934999999999896 | 0.022 | 0.05 | -0.017 |
| 1.939999999999896 | 0.022 | 0.053 | -0.017 |
| 1.944999999999896 | 0.021 | 0.056 | -0.017 |
| 1.949999999999896 | 0.021 | 0.06 | -0.017 |
| 1.954999999999896 | 0.021 | 0.063 | -0.016 |
| 1.959999999999896 | 0.021 | 0.067 | -0.016 |
| 1.964999999999896 | 0.02 | 0.072 | -0.016 |
| 1.969999999999896 | 0.02 | 0.077 | -0.016 |
| 1.974999999999895 | 0.02 | 0.083 | -0.016 |
| 1.979999999999895 | 0.02 | 0.09 | -0.016 |
| 1.984999999999895 | 0.019 | 0.099 | -0.016 |
| 1.989999999999895 | 0.019 | 0.112 | -0.016 |
| 1.994999999999895 | 0.019 | 0.134 | -0.015 |
| 1.999999999999895 | 0.019 | 5 | -0.015 |
| 2.004999999999895 | 0.019 | 0.135 | -0.015 |
| 2.009999999999895 | 0.018 | 0.113 | -0.015 |
| 2.014999999999895 | 0.018 | 0.101 | -0.015 |
| 2.019999999999895 | 0.018 | 0.092 | -0.015 |
| 2.024999999999895 | 0.018 | 0.085 | -0.015 |
| 2.029999999999895 | 0.018 | 0.08 | -0.015 |
| 2.034999999999894 | 0.017 | 0.075 | -0.014 |
| 2.039999999999894 | 0.017 | 0.071 | -0.014 |
| 2.044999999999894 | 0.017 | 0.068 | -0.014 |
| 2.049999999999894 | 0.017 | 0.065 | -0.014 |
| 2.054999999999894 | 0.017 | 0.062 | -0.014 |
| 2.059999999999894 | 0.017 | 0.06 | -0.014 |
| 2.064999999999894 | 0.016 | 0.058 | -0.014 |
| 2.069999999999894 | 0.016 | 0.056 | -0.014 |
| 2.074999999999894 | 0.016 | 0.054 | -0.013 |
| 2.079999999999893 | 0.016 | 0.052 | -0.013 |
| 2.084999999999893 | 0.016 | 0.05 | -0.013 |
| 2.089999999999893 | 0.016 | 0.049 | -0.013 |
| 2.094999999999893 | 0.015 | 0.047 | -0.013 |
| 2.099999999999893 | 0.015 | 0.046 | -0.013 |
| 2.104999999999893 | 0.015 | 0.045 | -0.013 |
| 2.109999999999893 | 0.015 | 0.043 | -0.013 |
| 2.114999999999893 | 0.015 | 0.042 | -0.012 |
| 2.119999999999893 | 0.015 | 0.041 | -0.012 |
| 2.124999999999893 | 0.014 | 0.04 | -0.012 |
| 2.129999999999892 | 0.014 | 0.039 | -0.012 |
| 2.134999999999892 | 0.014 | 0.038 | -0.012 |
| 2.139999999999892 | 0.014 | 0.037 | -0.012 |
| 2.144999999999892 | 0.014 | 0.036 | -0.012 |
| 2.149999999999892 | 0.014 | 0.036 | -0.012 |
| 2.154999999999892 | 0.014 | 0.035 | -0.012 |
| 2.159999999999892 | 0.013 | 0.034 | -0.011 |
| 2.164999999999892 | 0.013 | 0.033 | -0.011 |
| 2.169999999999892 | 0.013 | 0.033 | -0.011 |
| 2.174999999999891 | 0.013 | 0.032 | -0.011 |
| 2.179999999999891 | 0.013 | 0.031 | -0.011 |
| 2.184999999999891 | 0.013 | 0.031 | -0.011 |
| 2.189999999999891 | 0.013 | 0.03 | -0.011 |
| 2.194999999999891 | 0.013 | 0.029 | -0.011 |
| 2.199999999999891 | 0.012 | 0.029 | -0.011 |
| 2.204999999999891 | 0.012 | 0.028 | -0.01 |
| 2.209999999999891 | 0.012 | 0.028 | -0.01 |
| 2.214999999999891 | 0.012 | 0.027 | -0.01 |
| 2.21999999999989 | 0.012 | 0.027 | -0.01 |
| 2.22499999999989 | 0.012 | 0.026 | -0.01 |
| 2.22999999999989 | 0.012 | 0.026 | -0.01 |
| 2.23499999999989 | 0.012 | 0.025 | -0.01 |
| 2.23999999999989 | 0.011 | 0.025 | -0.01 |
| 2.24499999999989 | 0.011 | 0.025 | -0.01 |
| 2.24999999999989 | 0.011 | 0.024 | -0.009 |
| 2.25499999999989 | 0.011 | 0.024 | -0.009 |
| 2.25999999999989 | 0.011 | 0.023 | -0.009 |
| 2.26499999999989 | 0.011 | 0.023 | -0.009 |
| 2.269999999999889 | 0.011 | 0.023 | -0.009 |
| 2.274999999999889 | 0.011 | 0.022 | -0.009 |
| 2.279999999999889 | 0.011 | 0.022 | -0.009 |
| 2.284999999999889 | 0.011 | 0.021 | -0.009 |
| 2.289999999999889 | 0.01 | 0.021 | -0.009 |
| 2.294999999999889 | 0.01 | 0.021 | -0.008 |
| 2.299999999999889 | 0.01 | 0.02 | -0.008 |
| 2.304999999999889 | 0.01 | 0.02 | -0.008 |
| 2.309999999999889 | 0.01 | 0.02 | -0.008 |
| 2.314999999999888 | 0.01 | 0.02 | -0.008 |
| 2.319999999999888 | 0.01 | 0.019 | -0.008 |
| 2.324999999999888 | 0.01 | 0.019 | -0.008 |
| 2.329999999999888 | 0.01 | 0.019 | -0.008 |
| 2.334999999999888 | 0.01 | 0.018 | -0.008 |
| 2.339999999999888 | 0.01 | 0.018 | -0.007 |
| 2.344999999999888 | 0.009 | 0.018 | -0.007 |
| 2.349999999999888 | 0.009 | 0.018 | -0.007 |
| 2.354999999999888 | 0.009 | 0.017 | -0.007 |
| 2.359999999999887 | 0.009 | 0.017 | -0.007 |
| 2.364999999999887 | 0.009 | 0.017 | -0.007 |
| 2.369999999999887 | 0.009 | 0.017 | -0.007 |
| 2.374999999999887 | 0.009 | 0.016 | -0.007 |
| 2.379999999999887 | 0.009 | 0.016 | -0.007 |
| 2.384999999999887 | 0.009 | 0.016 | -0.006 |
| 2.389999999999887 | 0.009 | 0.016 | -0.006 |
| 2.394999999999887 | 0.009 | 0.016 | -0.006 |
| 2.399999999999887 | 0.009 | 0.015 | -0.006 |
| 2.404999999999887 | 0.008 | 0.015 | -0.006 |
| 2.409999999999886 | 0.008 | 0.015 | -0.006 |
| 2.414999999999886 | 0.008 | 0.015 | -0.006 |
| 2.419999999999886 | 0.008 | 0.015 | -0.006 |
| 2.424999999999886 | 0.008 | 0.014 | -0.006 |
| 2.429999999999886 | 0.008 | 0.014 | -0.005 |
| 2.434999999999886 | 0.008 | 0.014 | -0.005 |
| 2.439999999999886 | 0.008 | 0.014 | -0.005 |
| 2.444999999999886 | 0.008 | 0.014 | -0.005 |
| 2.449999999999886 | 0.008 | 0.013 | -0.005 |
| 2.454999999999885 | 0.008 | 0.013 | -0.005 |
| 2.459999999999885 | 0.008 | 0.013 | -0.005 |
| 2.464999999999885 | 0.008 | 0.013 | -0.005 |
| 2.469999999999885 | 0.008 | 0.013 | -0.005 |
| 2.474999999999885 | 0.007 | 0.013 | -0.004 |
| 2.479999999999885 | 0.007 | 0.013 | -0.004 |
| 2.484999999999885 | 0.007 | 0.012 | -0.004 |
| 2.489999999999885 | 0.007 | 0.012 | -0.004 |
| 2.494999999999885 | 0.007 | 0.012 | -0.004 |
| 2.499999999999884 | 0.007 | 0.012 | -0.004 |
| 2.504999999999884 | 0.007 | 0.012 | -0.004 |
| 2.509999999999884 | 0.007 | 0.012 | -0.004 |
| 2.514999999999884 | 0.007 | 0.012 | -0.003 |
| 2.519999999999884 | 0.007 | 0.011 | -0.003 |
| 2.524999999999884 | 0.007 | 0.011 | -0.003 |
| 2.529999999999884 | 0.007 | 0.011 | -0.003 |
| 2.534999999999884 | 0.007 | 0.011 | -0.003 |
| 2.539999999999884 | 0.007 | 0.011 | -0.003 |
| 2.544999999999884 | 0.007 | 0.011 | -0.003 |
| 2.549999999999883 | 0.007 | 0.011 | -0.003 |
| 2.554999999999883 | 0.007 | 0.01 | -0.003 |
| 2.559999999999883 | 0.006 | 0.01 | -0.002 |
| 2.564999999999883 | 0.006 | 0.01 | -0.002 |
| 2.569999999999883 | 0.006 | 0.01 | -0.002 |
| 2.574999999999883 | 0.006 | 0.01 | -0.002 |
| 2.579999999999883 | 0.006 | 0.01 | -0.002 |
| 2.584999999999883 | 0.006 | 0.01 | -0.002 |
| 2.589999999999883 | 0.006 | 0.01 | -0.002 |
| 2.594999999999882 | 0.006 | 0.01 | -0.002 |
| 2.599999999999882 | 0.006 | 0.01 | -0.001 |
| 2.604999999999882 | 0.006 | 0.009 | -0.001 |
| 2.609999999999882 | 0.006 | 0.009 | -0.001 |
| 2.614999999999882 | 0.006 | 0.009 | -0.001 |
| 2.619999999999882 | 0.006 | 0.009 | -0.001 |
| 2.624999999999882 | 0.006 | 0.009 | -0.001 |
| 2.629999999999882 | 0.006 | 0.009 | -0.001 |
| 2.634999999999882 | 0.006 | 0.009 | 0 |
| 2.639999999999881 | 0.006 | 0.009 | 0 |
| 2.644999999999881 | 0.006 | 0.009 | 0 |
| 2.649999999999881 | 0.006 | 0.009 | 0 |
| 2.654999999999881 | 0.006 | 0.008 | 0 |
| 2.659999999999881 | 0.006 | 0.008 | 0 |
| 2.664999999999881 | 0.005 | 0.008 | 0 |
| 2.669999999999881 | 0.005 | 0.008 | 0 |
| 2.674999999999881 | 0.005 | 0.008 | 0.001 |
| 2.679999999999881 | 0.005 | 0.008 | 0.001 |
| 2.68499999999988 | 0.005 | 0.008 | 0.001 |
| 2.68999999999988 | 0.005 | 0.008 | 0.001 |
| 2.69499999999988 | 0.005 | 0.008 | 0.001 |
| 2.69999999999988 | 0.005 | 0.008 | 0.001 |
| 2.70499999999988 | 0.005 | 0.008 | 0.001 |
| 2.70999999999988 | 0.005 | 0.008 | 0.002 |
| 2.71499999999988 | 0.005 | 0.007 | 0.002 |
| 2.71999999999988 | 0.005 | 0.007 | 0.002 |
| 2.72499999999988 | 0.005 | 0.007 | 0.002 |
| 2.72999999999988 | 0.005 | 0.007 | 0.002 |
| 2.734999999999879 | 0.005 | 0.007 | 0.002 |
| 2.739999999999879 | 0.005 | 0.007 | 0.003 |
| 2.744999999999879 | 0.005 | 0.007 | 0.003 |
| 2.749999999999879 | 0.005 | 0.007 | 0.003 |
| 2.754999999999879 | 0.005 | 0.007 | 0.003 |
| 2.759999999999879 | 0.005 | 0.007 | 0.003 |
| 2.764999999999879 | 0.005 | 0.007 | 0.003 |
| 2.769999999999879 | 0.005 | 0.007 | 0.004 |
| 2.774999999999879 | 0.005 | 0.007 | 0.004 |
| 2.779999999999878 | 0.005 | 0.007 | 0.004 |
| 2.784999999999878 | 0.005 | 0.007 | 0.004 |
| 2.789999999999878 | 0.005 | 0.006 | 0.004 |
| 2.794999999999878 | 0.004 | 0.006 | 0.005 |
| 2.799999999999878 | 0.004 | 0.006 | 0.005 |
| 2.804999999999878 | 0.004 | 0.006 | 0.005 |
| 2.809999999999878 | 0.004 | 0.006 | 0.005 |
| 2.814999999999878 | 0.004 | 0.006 | 0.005 |
| 2.819999999999878 | 0.004 | 0.006 | 0.006 |
| 2.824999999999878 | 0.004 | 0.006 | 0.006 |
| 2.829999999999877 | 0.004 | 0.006 | 0.006 |
| 2.834999999999877 | 0.004 | 0.006 | 0.006 |
| 2.839999999999877 | 0.004 | 0.006 | 0.006 |
| 2.844999999999877 | 0.004 | 0.006 | 0.007 |
| 2.849999999999877 | 0.004 | 0.006 | 0.007 |
| 2.854999999999877 | 0.004 | 0.006 | 0.007 |
| 2.859999999999877 | 0.004 | 0.006 | 0.007 |
| 2.864999999999877 | 0.004 | 0.006 | 0.008 |
| 2.869999999999877 | 0.004 | 0.006 | 0.008 |
| 2.874999999999876 | 0.004 | 0.006 | 0.008 |
| 2.879999999999876 | 0.004 | 0.006 | 0.009 |
| 2.884999999999876 | 0.004 | 0.005 | 0.009 |
| 2.889999999999876 | 0.004 | 0.005 | 0.009 |
| 2.894999999999876 | 0.004 | 0.005 | 0.009 |
| 2.899999999999876 | 0.004 | 0.005 | 0.01 |
| 2.904999999999876 | 0.004 | 0.005 | 0.01 |
| 2.909999999999876 | 0.004 | 0.005 | 0.011 |
| 2.914999999999876 | 0.004 | 0.005 | 0.011 |
| 2.919999999999876 | 0.004 | 0.005 | 0.011 |
| 2.924999999999875 | 0.004 | 0.005 | 0.012 |
| 2.929999999999875 | 0.004 | 0.005 | 0.012 |
| 2.934999999999875 | 0.004 | 0.005 | 0.013 |
| 2.939999999999875 | 0.004 | 0.005 | 0.013 |
| 2.944999999999875 | 0.004 | 0.005 | 0.014 |
| 2.949999999999875 | 0.004 | 0.005 | 0.014 |
| 2.954999999999875 | 0.004 | 0.005 | 0.015 |
| 2.959999999999875 | 0.004 | 0.005 | 0.016 |
| 2.964999999999875 | 0.004 | 0.005 | 0.017 |
| 2.969999999999874 | 0.003 | 0.005 | 0.018 |
| 2.974999999999874 | 0.003 | 0.005 | 0.019 |
| 2.979999999999874 | 0.003 | 0.005 | 0.02 |
| 2.984999999999874 | 0.003 | 0.005 | 0.022 |
| 2.989999999999874 | 0.003 | 0.005 | 0.025 |
| 2.994999999999874 | 0.003 | 0.005 | 0.029 |
| 2.999999999999874 | 0.003 | 0.004 | 5 |
| 3.004999999999874 | 0.003 | 0.004 | 0.029 |
| 3.009999999999874 | 0.003 | 0.004 | 0.025 |
| 3.014999999999874 | 0.003 | 0.004 | 0.022 |
| 3.019999999999873 | 0.003 | 0.004 | 0.021 |
| 3.024999999999873 | 0.003 | 0.004 | 0.019 |
| 3.029999999999873 | 0.003 | 0.004 | 0.018 |
| 3.034999999999873 | 0.003 | 0.004 | 0.017 |
| 3.039999999999873 | 0.003 | 0.004 | 0.016 |
| 3.044999999999873 | 0.003 | 0.004 | 0.016 |
| 3.049999999999873 | 0.003 | 0.004 | 0.015 |
| 3.054999999999873 | 0.003 | 0.004 | 0.015 |
| 3.059999999999873 | 0.003 | 0.004 | 0.014 |
| 3.064999999999872 | 0.003 | 0.004 | 0.014 |
| 3.069999999999872 | 0.003 | 0.004 | 0.013 |
| 3.074999999999872 | 0.003 | 0.004 | 0.013 |
| 3.079999999999872 | 0.003 | 0.004 | 0.012 |
| 3.084999999999872 | 0.003 | 0.004 | 0.012 |
| 3.089999999999872 | 0.003 | 0.004 | 0.012 |
| 3.094999999999872 | 0.003 | 0.004 | 0.012 |
| 3.099999999999872 | 0.003 | 0.004 | 0.011 |
| 3.104999999999872 | 0.003 | 0.004 | 0.011 |
| 3.109999999999872 | 0.003 | 0.004 | 0.011 |
| 3.114999999999871 | 0.003 | 0.004 | 0.01 |
| 3.119999999999871 | 0.003 | 0.004 | 0.01 |
| 3.124999999999871 | 0.003 | 0.004 | 0.01 |
| 3.129999999999871 | 0.003 | 0.004 | 0.01 |
| 3.134999999999871 | 0.003 | 0.004 | 0.01 |
| 3.139999999999871 | 0.003 | 0.004 | 0.009 |
| 3.144999999999871 | 0.003 | 0.004 | 0.009 |
| 3.149999999999871 | 0.003 | 0.004 | 0.009 |
| 3.154999999999871 | 0.003 | 0.004 | 0.009 |
| 3.15999999999987 | 0.003 | 0.003 | 0.009 |
| 3.16499999999987 | 0.003 | 0.003 | 0.009 |
| 3.16999999999987 | 0.003 | 0.003 | 0.008 |
| 3.17499999999987 | 0.003 | 0.003 | 0.008 |
| 3.17999999999987 | 0.003 | 0.003 | 0.008 |
| 3.18499999999987 | 0.003 | 0.003 | 0.008 |
| 3.18999999999987 | 0.003 | 0.003 | 0.008 |
| 3.19499999999987 | 0.003 | 0.003 | 0.008 |
| 3.19999999999987 | 0.003 | 0.003 | 0.008 |
| 3.204999999999869 | 0.003 | 0.003 | 0.007 |
| 3.209999999999869 | 0.003 | 0.003 | 0.007 |
| 3.214999999999869 | 0.003 | 0.003 | 0.007 |
| 3.219999999999869 | 0.002 | 0.003 | 0.007 |
| 3.224999999999869 | 0.002 | 0.003 | 0.007 |
| 3.229999999999869 | 0.002 | 0.003 | 0.007 |
| 3.234999999999869 | 0.002 | 0.003 | 0.007 |
| 3.239999999999869 | 0.002 | 0.003 | 0.007 |
| 3.244999999999869 | 0.002 | 0.003 | 0.007 |
| 3.249999999999869 | 0.002 | 0.003 | 0.007 |
| 3.254999999999868 | 0.002 | 0.003 | 0.006 |
| 3.259999999999868 | 0.002 | 0.003 | 0.006 |
| 3.264999999999868 | 0.002 | 0.003 | 0.006 |
| 3.269999999999868 | 0.002 | 0.003 | 0.006 |
| 3.274999999999868 | 0.002 | 0.003 | 0.006 |
| 3.279999999999868 | 0.002 | 0.003 | 0.006 |
| 3.284999999999868 | 0.002 | 0.003 | 0.006 |
| 3.289999999999868 | 0.002 | 0.003 | 0.006 |
| 3.294999999999868 | 0.002 | 0.003 | 0.006 |
| 3.299999999999867 | 0.002 | 0.003 | 0.006 |
| 3.304999999999867 | 0.002 | 0.003 | 0.006 |
| 3.309999999999867 | 0.002 | 0.003 | 0.006 |
| 3.314999999999867 | 0.002 | 0.003 | 0.005 |
| 3.319999999999867 | 0.002 | 0.003 | 0.005 |
| 3.324999999999867 | 0.002 | 0.003 | 0.005 |
| 3.329999999999867 | 0.002 | 0.003 | 0.005 |
| 3.334999999999867 | 0.002 | 0.003 | 0.005 |
| 3.339999999999867 | 0.002 | 0.003 | 0.005 |
| 3.344999999999866 | 0.002 | 0.003 | 0.005 |
| 3.349999999999866 | 0.002 | 0.003 | 0.005 |
| 3.354999999999866 | 0.002 | 0.003 | 0.005 |
| 3.359999999999866 | 0.002 | 0.003 | 0.005 |
| 3.364999999999866 | 0.002 | 0.003 | 0.005 |
| 3.369999999999866 | 0.002 | 0.003 | 0.005 |
| 3.374999999999866 | 0.002 | 0.003 | 0.005 |
| 3.379999999999866 | 0.002 | 0.003 | 0.005 |
| 3.384999999999866 | 0.002 | 0.003 | 0.005 |
| 3.389999999999866 | 0.002 | 0.002 | 0.005 |
| 3.394999999999865 | 0.002 | 0.002 | 0.005 |
| 3.399999999999865 | 0.002 | 0.002 | 0.004 |
| 3.404999999999865 | 0.002 | 0.002 | 0.004 |
| 3.409999999999865 | 0.002 | 0.002 | 0.004 |
| 3.414999999999865 | 0.002 | 0.002 | 0.004 |
| 3.419999999999865 | 0.002 | 0.002 | 0.004 |
| 3.424999999999865 | 0.002 | 0.002 | 0.004 |
| 3.429999999999865 | 0.002 | 0.002 | 0.004 |
| 3.434999999999865 | 0.002 | 0.002 | 0.004 |
| 3.439999999999864 | 0.002 | 0.002 | 0.004 |
| 3.444999999999864 | 0.002 | 0.002 | 0.004 |
| 3.449999999999864 | 0.002 | 0.002 | 0.004 |
| 3.454999999999864 | 0.002 | 0.002 | 0.004 |
| 3.459999999999864 | 0.002 | 0.002 | 0.004 |
| 3.464999999999864 | 0.002 | 0.002 | 0.004 |
| 3.469999999999864 | 0.002 | 0.002 | 0.004 |
| 3.474999999999864 | 0.002 | 0.002 | 0.004 |
| 3.479999999999864 | 0.002 | 0.002 | 0.004 |
| 3.484999999999864 | 0.002 | 0.002 | 0.004 |
| 3.489999999999863 | 0.002 | 0.002 | 0.004 |
| 3.494999999999863 | 0.002 | 0.002 | 0.004 |
| 3.499999999999863 | 0.002 | 0.002 | 0.004 |
| 3.504999999999863 | 0.002 | 0.002 | 0.004 |
| 3.509999999999863 | 0.002 | 0.002 | 0.004 |
| 3.514999999999863 | 0.002 | 0.002 | 0.004 |
| 3.519999999999863 | 0.002 | 0.002 | 0.004 |
| 3.524999999999863 | 0.002 | 0.002 | 0.003 |
| 3.529999999999863 | 0.002 | 0.002 | 0.003 |
| 3.534999999999862 | 0.002 | 0.002 | 0.003 |
| 3.539999999999862 | 0.002 | 0.002 | 0.003 |
| 3.544999999999862 | 0.002 | 0.002 | 0.003 |
| 3.549999999999862 | 0.002 | 0.002 | 0.003 |
| 3.554999999999862 | 0.002 | 0.002 | 0.003 |
| 3.559999999999862 | 0.002 | 0.002 | 0.003 |
| 3.564999999999862 | 0.002 | 0.002 | 0.003 |
| 3.569999999999862 | 0.002 | 0.002 | 0.003 |
| 3.574999999999862 | 0.002 | 0.002 | 0.003 |
| 3.579999999999862 | 0.002 | 0.002 | 0.003 |
| 3.584999999999861 | 0.002 | 0.002 | 0.003 |
| 3.589999999999861 | 0.002 | 0.002 | 0.003 |
| 3.594999999999861 | 0.002 | 0.002 | 0.003 |
| 3.599999999999861 | 0.002 | 0.002 | 0.003 |
| 3.604999999999861 | 0.002 | 0.002 | 0.003 |
| 3.609999999999861 | 0.002 | 0.002 | 0.003 |
| 3.614999999999861 | 0.002 | 0.002 | 0.003 |
| 3.619999999999861 | 0.002 | 0.002 | 0.003 |
| 3.62499999999986 | 0.002 | 0.002 | 0.003 |
| 3.62999999999986 | 0.002 | 0.002 | 0.003 |
| 3.63499999999986 | 0.002 | 0.002 | 0.003 |
| 3.63999999999986 | 0.002 | 0.002 | 0.003 |
| 3.64499999999986 | 0.001 | 0.002 | 0.003 |
| 3.64999999999986 | 0.001 | 0.002 | 0.003 |
| 3.65499999999986 | 0.001 | 0.002 | 0.003 |
| 3.65999999999986 | 0.001 | 0.002 | 0.003 |
| 3.66499999999986 | 0.001 | 0.002 | 0.003 |
| 3.669999999999859 | 0.001 | 0.002 | 0.003 |
| 3.674999999999859 | 0.001 | 0.002 | 0.003 |
| 3.679999999999859 | 0.001 | 0.002 | 0.003 |
| 3.684999999999859 | 0.001 | 0.002 | 0.003 |
| 3.689999999999859 | 0.001 | 0.002 | 0.003 |
| 3.694999999999859 | 0.001 | 0.002 | 0.003 |
| 3.699999999999859 | 0.001 | 0.002 | 0.003 |
| 3.704999999999859 | 0.001 | 0.002 | 0.003 |
| 3.709999999999859 | 0.001 | 0.002 | 0.003 |
| 3.714999999999859 | 0.001 | 0.002 | 0.002 |
| 3.719999999999858 | 0.001 | 0.002 | 0.002 |
| 3.724999999999858 | 0.001 | 0.002 | 0.002 |
| 3.729999999999858 | 0.001 | 0.002 | 0.002 |
| 3.734999999999858 | 0.001 | 0.002 | 0.002 |
| 3.739999999999858 | 0.001 | 0.002 | 0.002 |
| 3.744999999999858 | 0.001 | 0.002 | 0.002 |
| 3.749999999999858 | 0.001 | 0.002 | 0.002 |
| 3.754999999999858 | 0.001 | 0.002 | 0.002 |
| 3.759999999999858 | 0.001 | 0.002 | 0.002 |
| 3.764999999999857 | 0.001 | 0.002 | 0.002 |
| 3.769999999999857 | 0.001 | 0.002 | 0.002 |
| 3.774999999999857 | 0.001 | 0.002 | 0.002 |
| 3.779999999999857 | 0.001 | 0.002 | 0.002 |
| 3.784999999999857 | 0.001 | 0.002 | 0.002 |
| 3.789999999999857 | 0.001 | 0.001 | 0.002 |
| 3.794999999999857 | 0.001 | 0.001 | 0.002 |
| 3.799999999999857 | 0.001 | 0.001 | 0.002 |
| 3.804999999999857 | 0.001 | 0.001 | 0.002 |
| 3.809999999999857 | 0.001 | 0.001 | 0.002 |
| 3.814999999999856 | 0.001 | 0.001 | 0.002 |
| 3.819999999999856 | 0.001 | 0.001 | 0.002 |
| 3.824999999999856 | 0.001 | 0.001 | 0.002 |
| 3.829999999999856 | 0.001 | 0.001 | 0.002 |
| 3.834999999999856 | 0.001 | 0.001 | 0.002 |
| 3.839999999999856 | 0.001 | 0.001 | 0.002 |
| 3.844999999999856 | 0.001 | 0.001 | 0.002 |
| 3.849999999999856 | 0.001 | 0.001 | 0.002 |
| 3.854999999999856 | 0.001 | 0.001 | 0.002 |
| 3.859999999999855 | 0.001 | 0.001 | 0.002 |
| 3.864999999999855 | 0.001 | 0.001 | 0.002 |
| 3.869999999999855 | 0.001 | 0.001 | 0.002 |
| 3.874999999999855 | 0.001 | 0.001 | 0.002 |
| 3.879999999999855 | 0.001 | 0.001 | 0.002 |
| 3.884999999999855 | 0.001 | 0.001 | 0.002 |
| 3.889999999999855 | 0.001 | 0.001 | 0.002 |
| 3.894999999999855 | 0.001 | 0.001 | 0.002 |
| 3.899999999999855 | 0.001 | 0.001 | 0.002 |
| 3.904999999999855 | 0.001 | 0.001 | 0.002 |
| 3.909999999999854 | 0.001 | 0.001 | 0.002 |
| 3.914999999999854 | 0.001 | 0.001 | 0.002 |
| 3.919999999999854 | 0.001 | 0.001 | 0.002 |
| 3.924999999999854 | 0.001 | 0.001 | 0.002 |
| 3.929999999999854 | 0.001 | 0.001 | 0.002 |
| 3.934999999999854 | 0.001 | 0.001 | 0.002 |
| 3.939999999999854 | 0.001 | 0.001 | 0.002 |
| 3.944999999999854 | 0.001 | 0.001 | 0.002 |
| 3.949999999999854 | 0.001 | 0.001 | 0.002 |
| 3.954999999999853 | 0.001 | 0.001 | 0.002 |
| 3.959999999999853 | 0.001 | 0.001 | 0.002 |
| 3.964999999999853 | 0.001 | 0.001 | 0.002 |
| 3.969999999999853 | 0.001 | 0.001 | 0.002 |
| 3.974999999999853 | 0.001 | 0.001 | 0.002 |
| 3.979999999999853 | 0.001 | 0.001 | 0.002 |
| 3.984999999999853 | 0.001 | 0.001 | 0.002 |
| 3.989999999999853 | 0.001 | 0.001 | 0.002 |
| 3.994999999999853 | 0.001 | 0.001 | 0.002 |
| 3.999999999999853 | 0.001 | 0.001 | 0.002 |
| 4.004999999999852 | 0.001 | 0.001 | 0.002 |
| 4.009999999999852 | 0.001 | 0.001 | 0.002 |
| 4.014999999999852 | 0.001 | 0.001 | 0.002 |
| 4.019999999999852 | 0.001 | 0.001 | 0.002 |
| 4.024999999999852 | 0.001 | 0.001 | 0.002 |
| 4.029999999999852 | 0.001 | 0.001 | 0.002 |
| 4.034999999999852 | 0.001 | 0.001 | 0.002 |
| 4.039999999999851 | 0.001 | 0.001 | 0.002 |
| 4.044999999999852 | 0.001 | 0.001 | 0.002 |
| 4.049999999999851 | 0.001 | 0.001 | 0.002 |
| 4.054999999999851 | 0.001 | 0.001 | 0.002 |
| 4.059999999999851 | 0.001 | 0.001 | 0.002 |
| 4.064999999999851 | 0.001 | 0.001 | 0.001 |
| 4.069999999999851 | 0.001 | 0.001 | 0.001 |
| 4.074999999999851 | 0.001 | 0.001 | 0.001 |
| 4.07999999999985 | 0.001 | 0.001 | 0.001 |
| 4.084999999999851 | 0.001 | 0.001 | 0.001 |
| 4.08999999999985 | 0.001 | 0.001 | 0.001 |
| 4.094999999999851 | 0.001 | 0.001 | 0.001 |
| 4.09999999999985 | 0.001 | 0.001 | 0.001 |
| 4.10499999999985 | 0.001 | 0.001 | 0.001 |
| 4.10999999999985 | 0.001 | 0.001 | 0.001 |
| 4.11499999999985 | 0.001 | 0.001 | 0.001 |
| 4.11999999999985 | 0.001 | 0.001 | 0.001 |
| 4.12499999999985 | 0.001 | 0.001 | 0.001 |
| 4.12999999999985 | 0.001 | 0.001 | 0.001 |
| 4.13499999999985 | 0.001 | 0.001 | 0.001 |
| 4.13999999999985 | 0.001 | 0.001 | 0.001 |
| 4.144999999999849 | 0.001 | 0.001 | 0.001 |
| 4.14999999999985 | 0.001 | 0.001 | 0.001 |
| 4.154999999999849 | 0.001 | 0.001 | 0.001 |
| 4.15999999999985 | 0.001 | 0.001 | 0.001 |
| 4.164999999999849 | 0.001 | 0.001 | 0.001 |
| 4.169999999999849 | 0.001 | 0.001 | 0.001 |
| 4.174999999999849 | 0.001 | 0.001 | 0.001 |
| 4.179999999999848 | 0.001 | 0.001 | 0.001 |
| 4.184999999999849 | 0.001 | 0.001 | 0.001 |
| 4.189999999999848 | 0.001 | 0.001 | 0.001 |
| 4.194999999999848 | 0.001 | 0.001 | 0.001 |
| 4.199999999999848 | 0.001 | 0.001 | 0.001 |
| 4.204999999999848 | 0.001 | 0.001 | 0.001 |
| 4.209999999999848 | 0.001 | 0.001 | 0.001 |
| 4.214999999999848 | 0.001 | 0.001 | 0.001 |
| 4.219999999999847 | 0.001 | 0.001 | 0.001 |
| 4.224999999999848 | 0.001 | 0.001 | 0.001 |
| 4.229999999999847 | 0.001 | 0.001 | 0.001 |
| 4.234999999999847 | 0.001 | 0.001 | 0.001 |
| 4.239999999999847 | 0.001 | 0.001 | 0.001 |
| 4.244999999999847 | 0.001 | 0.001 | 0.001 |
| 4.249999999999847 | 0.001 | 0.001 | 0.001 |
| 4.254999999999847 | 0.001 | 0.001 | 0.001 |
| 4.259999999999846 | 0.001 | 0.001 | 0.001 |
| 4.264999999999847 | 0.001 | 0.001 | 0.001 |
| 4.269999999999846 | 0.001 | 0.001 | 0.001 |
| 4.274999999999846 | 0.001 | 0.001 | 0.001 |
| 4.279999999999846 | 0.001 | 0.001 | 0.001 |
| 4.284999999999846 | 0.001 | 0.001 | 0.001 |
| 4.289999999999846 | 0.001 | 0.001 | 0.001 |
| 4.294999999999846 | 0.001 | 0.001 | 0.001 |
| 4.299999999999846 | 0.001 | 0.001 | 0.001 |
| 4.304999999999846 | 0.001 | 0.001 | 0.001 |
| 4.309999999999845 | 0.001 | 0.001 | 0.001 |
| 4.314999999999846 | 0.001 | 0.001 | 0.001 |
| 4.319999999999845 | 0.001 | 0.001 | 0.001 |
| 4.324999999999846 | 0.001 | 0.001 | 0.001 |
| 4.329999999999845 | 0.001 | 0.001 | 0.001 |
| 4.334999999999845 | 0.001 | 0.001 | 0.001 |
| 4.339999999999845 | 0.001 | 0.001 | 0.001 |
| 4.344999999999845 | 0.001 | 0.001 | 0.001 |
| 4.349999999999845 | 0.001 | 0.001 | 0.001 |
| 4.354999999999845 | 0.001 | 0.001 | 0.001 |
| 4.359999999999844 | 0.001 | 0.001 | 0.001 |
| 4.364999999999845 | 0.001 | 0.001 | 0.001 |
| 4.369999999999844 | 0.001 | 0.001 | 0.001 |
| 4.374999999999844 | 0.001 | 0.001 | 0.001 |
| 4.379999999999844 | 0.001 | 0.001 | 0.001 |
| 4.384999999999844 | 0.001 | 0.001 | 0.001 |
| 4.389999999999844 | 0.001 | 0.001 | 0.001 |
| 4.394999999999844 | 0.001 | 0.001 | 0.001 |
| 4.399999999999844 | 0.001 | 0.001 | 0.001 |
| 4.404999999999844 | 0.001 | 0.001 | 0.001 |
| 4.409999999999843 | 0.001 | 0.001 | 0.001 |
| 4.414999999999844 | 0.001 | 0.001 | 0.001 |
| 4.419999999999843 | 0.001 | 0.001 | 0.001 |
| 4.424999999999843 | 0.001 | 0.001 | 0.001 |
| 4.429999999999843 | 0.001 | 0.001 | 0.001 |
| 4.434999999999843 | 0.001 | 0.001 | 0.001 |
| 4.439999999999843 | 0.001 | 0.001 | 0.001 |
| 4.444999999999843 | 0.001 | 0.001 | 0.001 |
| 4.449999999999842 | 0.001 | 0.001 | 0.001 |
| 4.454999999999843 | 0.001 | 0.001 | 0.001 |
| 4.459999999999842 | 0.001 | 0.001 | 0.001 |
| 4.464999999999843 | 0.001 | 0.001 | 0.001 |
| 4.469999999999842 | 0.001 | 0.001 | 0.001 |
| 4.474999999999842 | 0.001 | 0.001 | 0.001 |
| 4.479999999999842 | 0.001 | 0.001 | 0.001 |
| 4.484999999999842 | 0.001 | 0.001 | 0.001 |
| 4.489999999999842 | 0.001 | 0.001 | 0.001 |
| 4.494999999999842 | 0.001 | 0.001 | 0.001 |
| 4.499999999999841 | 0.001 | 0.001 | 0.001 |
| 4.504999999999842 | 0.001 | 0.001 | 0.001 |
| 4.509999999999841 | 0.001 | 0.001 | 0.001 |
| 4.514999999999842 | 0.001 | 0.001 | 0.001 |
| 4.519999999999841 | 0.001 | 0.001 | 0.001 |
| 4.524999999999841 | 0.001 | 0.001 | 0.001 |
| 4.529999999999841 | 0.001 | 0.001 | 0.001 |
| 4.534999999999841 | 0.001 | 0.001 | 0.001 |
| 4.53999999999984 | 0.001 | 0.001 | 0.001 |
| 4.544999999999841 | 0.001 | 0.001 | 0.001 |
| 4.54999999999984 | 0.001 | 0.001 | 0.001 |
| 4.554999999999841 | 0.001 | 0.001 | 0.001 |
| 4.55999999999984 | 0.001 | 0.001 | 0.001 |
| 4.564999999999841 | 0.001 | 0.001 | 0.001 |
| 4.56999999999984 | 0.001 | 0.001 | 0.001 |
| 4.57499999999984 | 0.001 | 0.001 | 0.001 |
| 4.57999999999984 | 0.001 | 0.001 | 0.001 |
| 4.58499999999984 | 0.001 | 0.001 | 0.001 |
| 4.58999999999984 | 0.001 | 0.001 | 0.001 |
| 4.59499999999984 | 0.001 | 0.001 | 0.001 |
| 4.59999999999984 | 0.001 | 0.001 | 0.001 |
| 4.60499999999984 | 0.001 | 0.001 | 0.001 |
| 4.60999999999984 | 0.001 | 0.001 | 0.001 |
| 4.614999999999839 | 0.001 | 0.001 | 0.001 |
| 4.61999999999984 | 0.001 | 0.001 | 0.001 |
| 4.624999999999839 | 0.001 | 0.001 | 0.001 |
| 4.62999999999984 | 0.001 | 0.001 | 0.001 |
| 4.634999999999839 | 0.001 | 0.001 | 0.001 |
| 4.639999999999838 | 0.001 | 0.001 | 0.001 |
| 4.644999999999839 | 0.001 | 0.001 | 0.001 |
| 4.649999999999838 | 0.001 | 0.001 | 0.001 |
| 4.654999999999839 | 0.001 | 0.001 | 0.001 |
| 4.659999999999838 | 0.001 | 0.001 | 0.001 |
| 4.664999999999838 | 0.001 | 0.001 | 0.001 |
| 4.669999999999838 | 0.001 | 0.001 | 0.001 |
| 4.674999999999838 | 0.001 | 0.001 | 0.001 |
| 4.679999999999837 | 0.001 | 0.001 | 0.001 |
| 4.684999999999838 | 0.001 | 0.001 | 0.001 |
| 4.689999999999837 | 0.001 | 0.001 | 0.001 |
| 4.694999999999838 | 0.001 | 0.001 | 0.001 |
| 4.699999999999837 | 0.001 | 0.001 | 0.001 |
| 4.704999999999837 | 0.001 | 0.001 | 0.001 |
| 4.709999999999837 | 0.001 | 0.001 | 0.001 |
| 4.714999999999837 | 0.001 | 0.001 | 0.001 |
| 4.719999999999837 | 0.001 | 0.001 | 0.001 |
| 4.724999999999837 | 0.001 | 0.001 | 0.001 |
| 4.729999999999836 | 0.001 | 0.001 | 0.001 |
| 4.734999999999836 | 0.001 | 0.001 | 0.001 |
| 4.739999999999836 | 0.001 | 0.001 | 0.001 |
| 4.744999999999836 | 0.001 | 0.001 | 0.001 |
| 4.749999999999836 | 0.001 | 0.001 | 0.001 |
| 4.754999999999836 | 0.001 | 0.001 | 0.001 |
| 4.759999999999836 | 0.001 | 0.001 | 0.001 |
| 4.764999999999836 | 0 | 0.001 | 0.001 |
| 4.769999999999836 | 0 | 0.001 | 0.001 |
| 4.774999999999835 | 0 | 0.001 | 0.001 |
| 4.779999999999835 | 0 | 0.001 | 0.001 |
| 4.784999999999835 | 0 | 0.001 | 0.001 |
| 4.789999999999835 | 0 | 0.001 | 0.001 |
| 4.794999999999835 | 0 | 0.001 | 0.001 |
| 4.799999999999835 | 0 | 0.001 | 0.001 |
| 4.804999999999835 | 0 | 0.001 | 0.001 |
| 4.809999999999835 | 0 | 0.001 | 0.001 |
| 4.814999999999835 | 0 | 0.001 | 0.001 |
| 4.819999999999835 | 0 | 0.001 | 0.001 |
| 4.824999999999835 | 0 | 0.001 | 0.001 |
| 4.829999999999834 | 0 | 0.001 | 0.001 |
| 4.834999999999834 | 0 | 0.001 | 0.001 |
| 4.839999999999834 | 0 | 0.001 | 0.001 |
| 4.844999999999834 | 0 | 0.001 | 0.001 |
| 4.849999999999834 | 0 | 0.001 | 0.001 |
| 4.854999999999834 | 0 | 0.001 | 0.001 |
| 4.859999999999834 | 0 | 0.001 | 0.001 |
| 4.864999999999834 | 0 | 0.001 | 0.001 |
| 4.869999999999834 | 0 | 0.001 | 0.001 |
| 4.874999999999834 | 0 | 0 | 0.001 |
| 4.879999999999833 | 0 | 0 | 0.001 |
| 4.884999999999834 | 0 | 0 | 0.001 |
| 4.889999999999833 | 0 | 0 | 0.001 |
| 4.894999999999833 | 0 | 0 | 0.001 |
| 4.899999999999833 | 0 | 0 | 0.001 |
| 4.904999999999833 | 0 | 0 | 0.001 |
| 4.909999999999833 | 0 | 0 | 0.001 |
| 4.914999999999833 | 0 | 0 | 0.001 |
| 4.919999999999832 | 0 | 0 | 0.001 |
| 4.924999999999833 | 0 | 0 | 0.001 |
| 4.929999999999832 | 0 | 0 | 0.001 |
| 4.934999999999832 | 0 | 0 | 0.001 |
| 4.939999999999832 | 0 | 0 | 0.001 |
| 4.944999999999832 | 0 | 0 | 0.001 |
| 4.949999999999832 | 0 | 0 | 0.001 |
| 4.954999999999832 | 0 | 0 | 0.001 |
| 4.959999999999832 | 0 | 0 | 0.001 |
| 4.964999999999832 | 0 | 0 | 0.001 |
| 4.969999999999831 | 0 | 0 | 0.001 |
| 4.974999999999831 | 0 | 0 | 0.001 |
| 4.97999999999983 | 0 | 0 | 0.001 |
| 4.984999999999831 | 0 | 0 | 0.001 |
| 4.98999999999983 | 0 | 0 | 0.001 |
| 4.994999999999831 | 0 | 0 | 0.001 |
| 4.99999999999983 | 0 | 0 | 0.001 |